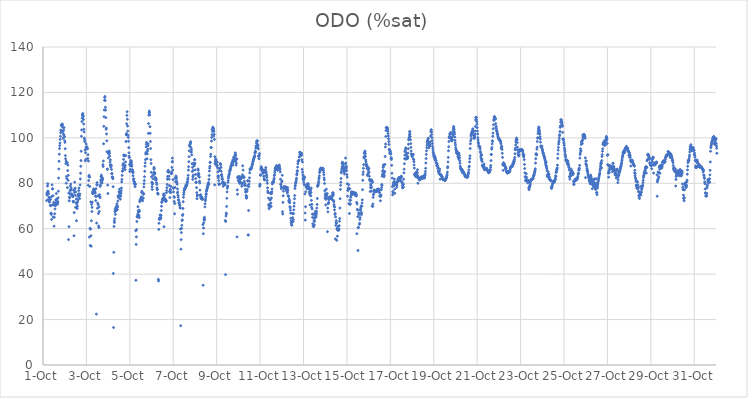
| Category | ODO (%sat) |
|---|---|
| 44470.166666666664 | 72.4 |
| 44470.177083333336 | 75.4 |
| 44470.1875 | 74.8 |
| 44470.197916666664 | 76 |
| 44470.208333333336 | 78.8 |
| 44470.21875 | 79.8 |
| 44470.229166666664 | 76.6 |
| 44470.239583333336 | 76.2 |
| 44470.25 | 72.9 |
| 44470.260416666664 | 75.4 |
| 44470.270833333336 | 73.9 |
| 44470.28125 | 72.2 |
| 44470.291666666664 | 71.7 |
| 44470.302083333336 | 72 |
| 44470.3125 | 73.8 |
| 44470.322916666664 | 72.9 |
| 44470.333333333336 | 70.3 |
| 44470.34375 | 72.9 |
| 44470.354166666664 | 70.1 |
| 44470.364583333336 | 66.8 |
| 44470.375 | 66.8 |
| 44470.385416666664 | 66.3 |
| 44470.395833333336 | 64.1 |
| 44470.40625 | 74.2 |
| 44470.416666666664 | 79.3 |
| 44470.427083333336 | 70.5 |
| 44470.4375 | 77.6 |
| 44470.447916666664 | 77.5 |
| 44470.458333333336 | 74.5 |
| 44470.46875 | 65.2 |
| 44470.479166666664 | 70.5 |
| 44470.489583333336 | 71.6 |
| 44470.5 | 70.7 |
| 44470.510416666664 | 61.1 |
| 44470.520833333336 | 65 |
| 44470.53125 | 70.6 |
| 44470.541666666664 | 66.6 |
| 44470.552083333336 | 68.7 |
| 44470.5625 | 70.4 |
| 44470.572916666664 | 70.1 |
| 44470.583333333336 | 71.2 |
| 44470.59375 | 72.7 |
| 44470.604166666664 | 72.4 |
| 44470.614583333336 | 75.5 |
| 44470.625 | 72.9 |
| 44470.635416666664 | 73 |
| 44470.645833333336 | 71.2 |
| 44470.65625 | 70.8 |
| 44470.666666666664 | 71.3 |
| 44470.677083333336 | 71 |
| 44470.6875 | 71.9 |
| 44470.697916666664 | 73.6 |
| 44470.708333333336 | 76.5 |
| 44470.71875 | 82.3 |
| 44470.729166666664 | 86.3 |
| 44470.739583333336 | 89.7 |
| 44470.75 | 92.8 |
| 44470.760416666664 | 95.3 |
| 44470.770833333336 | 96.6 |
| 44470.78125 | 97.7 |
| 44470.791666666664 | 99.3 |
| 44470.802083333336 | 100.7 |
| 44470.8125 | 102.3 |
| 44470.822916666664 | 103.4 |
| 44470.833333333336 | 103.3 |
| 44470.84375 | 105.4 |
| 44470.854166666664 | 105.5 |
| 44470.864583333336 | 105.8 |
| 44470.875 | 106 |
| 44470.885416666664 | 106.1 |
| 44470.895833333336 | 105.7 |
| 44470.90625 | 104.7 |
| 44470.916666666664 | 102.8 |
| 44470.927083333336 | 99.8 |
| 44470.9375 | 101.7 |
| 44470.947916666664 | 103.4 |
| 44470.958333333336 | 101.3 |
| 44470.96875 | 104.5 |
| 44470.979166666664 | 100.7 |
| 44470.989583333336 | 100.5 |
| 44471.0 | 98.7 |
| 44471.010416666664 | 98 |
| 44471.020833333336 | 95.2 |
| 44471.03125 | 92.2 |
| 44471.041666666664 | 90.8 |
| 44471.052083333336 | 88.7 |
| 44471.0625 | 89.8 |
| 44471.072916666664 | 80 |
| 44471.083333333336 | 83 |
| 44471.09375 | 82.1 |
| 44471.104166666664 | 89.1 |
| 44471.114583333336 | 89 |
| 44471.125 | 78.1 |
| 44471.135416666664 | 85.6 |
| 44471.145833333336 | 88 |
| 44471.15625 | 81.3 |
| 44471.166666666664 | 83.5 |
| 44471.177083333336 | 55.2 |
| 44471.1875 | 75.7 |
| 44471.197916666664 | 60.9 |
| 44471.208333333336 | 72.3 |
| 44471.21875 | 73.9 |
| 44471.229166666664 | 73.6 |
| 44471.239583333336 | 75.4 |
| 44471.25 | 76.7 |
| 44471.260416666664 | 78.8 |
| 44471.270833333336 | 77.3 |
| 44471.28125 | 79.7 |
| 44471.291666666664 | 77.1 |
| 44471.302083333336 | 77.9 |
| 44471.3125 | 75.3 |
| 44471.322916666664 | 74.7 |
| 44471.333333333336 | 75.2 |
| 44471.34375 | 74.5 |
| 44471.354166666664 | 74.9 |
| 44471.364583333336 | 74.3 |
| 44471.375 | 74.1 |
| 44471.385416666664 | 72 |
| 44471.395833333336 | 71.8 |
| 44471.40625 | 76.9 |
| 44471.416666666664 | 72 |
| 44471.427083333336 | 56.9 |
| 44471.4375 | 67.1 |
| 44471.447916666664 | 76 |
| 44471.458333333336 | 80.5 |
| 44471.46875 | 77.4 |
| 44471.479166666664 | 77.9 |
| 44471.489583333336 | 74.7 |
| 44471.5 | 69.4 |
| 44471.510416666664 | 76.2 |
| 44471.520833333336 | 71.3 |
| 44471.53125 | 73.1 |
| 44471.541666666664 | 63.5 |
| 44471.552083333336 | 69.4 |
| 44471.5625 | 70.9 |
| 44471.572916666664 | 68.9 |
| 44471.583333333336 | 69.9 |
| 44471.59375 | 71.8 |
| 44471.604166666664 | 72.7 |
| 44471.614583333336 | 74.2 |
| 44471.625 | 74.9 |
| 44471.635416666664 | 75.3 |
| 44471.645833333336 | 76.8 |
| 44471.65625 | 77.9 |
| 44471.666666666664 | 75.3 |
| 44471.677083333336 | 74.3 |
| 44471.6875 | 73.2 |
| 44471.697916666664 | 75.2 |
| 44471.708333333336 | 79.3 |
| 44471.71875 | 81.9 |
| 44471.729166666664 | 84.4 |
| 44471.739583333336 | 87.5 |
| 44471.75 | 90 |
| 44471.760416666664 | 94.1 |
| 44471.770833333336 | 100.7 |
| 44471.78125 | 103.5 |
| 44471.791666666664 | 107.2 |
| 44471.802083333336 | 108.7 |
| 44471.8125 | 110.1 |
| 44471.822916666664 | 110.1 |
| 44471.833333333336 | 110.7 |
| 44471.84375 | 109.7 |
| 44471.854166666664 | 109.4 |
| 44471.864583333336 | 108.1 |
| 44471.875 | 106.1 |
| 44471.885416666664 | 103.8 |
| 44471.895833333336 | 102.6 |
| 44471.90625 | 99.9 |
| 44471.916666666664 | 99.1 |
| 44471.927083333336 | 98.3 |
| 44471.9375 | 94.7 |
| 44471.947916666664 | 89.9 |
| 44471.958333333336 | 93.5 |
| 44471.96875 | 90.5 |
| 44471.979166666664 | 95.9 |
| 44471.989583333336 | 97.3 |
| 44472.0 | 95.4 |
| 44472.010416666664 | 95.6 |
| 44472.020833333336 | 96.1 |
| 44472.03125 | 95.4 |
| 44472.041666666664 | 95.3 |
| 44472.052083333336 | 95.2 |
| 44472.0625 | 90.9 |
| 44472.072916666664 | 92.6 |
| 44472.083333333336 | 79.1 |
| 44472.09375 | 89.8 |
| 44472.104166666664 | 81.2 |
| 44472.114583333336 | 83 |
| 44472.125 | 83.5 |
| 44472.135416666664 | 56.3 |
| 44472.145833333336 | 82.7 |
| 44472.15625 | 78.6 |
| 44472.166666666664 | 60.2 |
| 44472.177083333336 | 52.6 |
| 44472.1875 | 59.8 |
| 44472.197916666664 | 71.8 |
| 44472.208333333336 | 56.9 |
| 44472.21875 | 52.3 |
| 44472.229166666664 | 63.5 |
| 44472.239583333336 | 70.7 |
| 44472.25 | 67.6 |
| 44472.260416666664 | 69.4 |
| 44472.270833333336 | 71.7 |
| 44472.28125 | 76.1 |
| 44472.291666666664 | 75.5 |
| 44472.302083333336 | 75.4 |
| 44472.3125 | 76.4 |
| 44472.322916666664 | 77.3 |
| 44472.333333333336 | 77.5 |
| 44472.34375 | 76.6 |
| 44472.354166666664 | 76.8 |
| 44472.364583333336 | 76.8 |
| 44472.375 | 77.1 |
| 44472.385416666664 | 76.3 |
| 44472.395833333336 | 75.8 |
| 44472.40625 | 75.7 |
| 44472.416666666664 | 74.3 |
| 44472.427083333336 | 72.4 |
| 44472.4375 | 77.6 |
| 44472.447916666664 | 74.2 |
| 44472.458333333336 | 22.4 |
| 44472.46875 | 62.5 |
| 44472.479166666664 | 79.3 |
| 44472.489583333336 | 80.3 |
| 44472.5 | 79.3 |
| 44472.510416666664 | 69 |
| 44472.520833333336 | 71.3 |
| 44472.53125 | 74.5 |
| 44472.541666666664 | 70.6 |
| 44472.552083333336 | 66.7 |
| 44472.5625 | 61.2 |
| 44472.572916666664 | 60.5 |
| 44472.583333333336 | 69.6 |
| 44472.59375 | 67.6 |
| 44472.604166666664 | 75 |
| 44472.614583333336 | 74.1 |
| 44472.625 | 73.7 |
| 44472.635416666664 | 78.6 |
| 44472.645833333336 | 79.2 |
| 44472.65625 | 81.4 |
| 44472.666666666664 | 80.4 |
| 44472.677083333336 | 83 |
| 44472.6875 | 83.6 |
| 44472.697916666664 | 82.8 |
| 44472.708333333336 | 81.8 |
| 44472.71875 | 80.1 |
| 44472.729166666664 | 81.2 |
| 44472.739583333336 | 82.3 |
| 44472.75 | 81.9 |
| 44472.760416666664 | 88.2 |
| 44472.770833333336 | 87.4 |
| 44472.78125 | 89.8 |
| 44472.791666666664 | 97.4 |
| 44472.802083333336 | 105.1 |
| 44472.8125 | 109.3 |
| 44472.822916666664 | 112.3 |
| 44472.833333333336 | 116.5 |
| 44472.84375 | 117.8 |
| 44472.854166666664 | 118.2 |
| 44472.864583333336 | 116.5 |
| 44472.875 | 113.5 |
| 44472.885416666664 | 112.2 |
| 44472.895833333336 | 108.9 |
| 44472.90625 | 103.8 |
| 44472.916666666664 | 104.3 |
| 44472.927083333336 | 101.7 |
| 44472.9375 | 98.7 |
| 44472.947916666664 | 93.9 |
| 44472.958333333336 | 86.2 |
| 44472.96875 | 86.2 |
| 44472.979166666664 | 79.2 |
| 44472.989583333336 | 75.5 |
| 44473.0 | 93.3 |
| 44473.010416666664 | 91.2 |
| 44473.020833333336 | 93.1 |
| 44473.03125 | 93.3 |
| 44473.041666666664 | 93.7 |
| 44473.052083333336 | 94.2 |
| 44473.0625 | 93.2 |
| 44473.072916666664 | 92 |
| 44473.083333333336 | 89.3 |
| 44473.09375 | 88.1 |
| 44473.104166666664 | 90.3 |
| 44473.114583333336 | 87.7 |
| 44473.125 | 87.1 |
| 44473.135416666664 | 88.1 |
| 44473.145833333336 | 87.7 |
| 44473.15625 | 86.1 |
| 44473.166666666664 | 84.2 |
| 44473.177083333336 | 84.3 |
| 44473.1875 | 82.6 |
| 44473.197916666664 | 82.8 |
| 44473.208333333336 | 82.6 |
| 44473.21875 | 82 |
| 44473.229166666664 | 78.5 |
| 44473.239583333336 | 40.3 |
| 44473.25 | 16.5 |
| 44473.260416666664 | 49.6 |
| 44473.270833333336 | 61 |
| 44473.28125 | 63.4 |
| 44473.291666666664 | 62.7 |
| 44473.302083333336 | 64.4 |
| 44473.3125 | 67.5 |
| 44473.322916666664 | 68.5 |
| 44473.333333333336 | 66.3 |
| 44473.34375 | 67.8 |
| 44473.354166666664 | 69 |
| 44473.364583333336 | 69.3 |
| 44473.375 | 69.6 |
| 44473.385416666664 | 69.9 |
| 44473.395833333336 | 68.2 |
| 44473.40625 | 71 |
| 44473.416666666664 | 69.3 |
| 44473.427083333336 | 68.4 |
| 44473.4375 | 69.9 |
| 44473.447916666664 | 72.2 |
| 44473.458333333336 | 74.5 |
| 44473.46875 | 73.8 |
| 44473.479166666664 | 74.3 |
| 44473.489583333336 | 73.8 |
| 44473.5 | 76.2 |
| 44473.510416666664 | 76.2 |
| 44473.520833333336 | 77.4 |
| 44473.53125 | 76.2 |
| 44473.541666666664 | 75.5 |
| 44473.552083333336 | 75.3 |
| 44473.5625 | 73 |
| 44473.572916666664 | 74.4 |
| 44473.583333333336 | 74.4 |
| 44473.59375 | 75.7 |
| 44473.604166666664 | 76.7 |
| 44473.614583333336 | 77.9 |
| 44473.625 | 80.6 |
| 44473.635416666664 | 81.7 |
| 44473.645833333336 | 83.5 |
| 44473.65625 | 85.3 |
| 44473.666666666664 | 85.4 |
| 44473.677083333336 | 87.9 |
| 44473.6875 | 86.5 |
| 44473.697916666664 | 88.7 |
| 44473.708333333336 | 90.5 |
| 44473.71875 | 92.3 |
| 44473.729166666664 | 92.5 |
| 44473.739583333336 | 92 |
| 44473.75 | 87.6 |
| 44473.760416666664 | 87.9 |
| 44473.770833333336 | 87 |
| 44473.78125 | 86 |
| 44473.791666666664 | 87.8 |
| 44473.802083333336 | 89.4 |
| 44473.8125 | 92.2 |
| 44473.822916666664 | 98.4 |
| 44473.833333333336 | 101.3 |
| 44473.84375 | 101.9 |
| 44473.854166666664 | 106.2 |
| 44473.864583333336 | 109.9 |
| 44473.875 | 111.5 |
| 44473.885416666664 | 108.2 |
| 44473.895833333336 | 105.2 |
| 44473.90625 | 103 |
| 44473.916666666664 | 101.2 |
| 44473.927083333336 | 100.2 |
| 44473.9375 | 98.5 |
| 44473.947916666664 | 95.7 |
| 44473.958333333336 | 93.4 |
| 44473.96875 | 91.9 |
| 44473.979166666664 | 91.3 |
| 44473.989583333336 | 88.3 |
| 44474.0 | 85.2 |
| 44474.010416666664 | 86.1 |
| 44474.020833333336 | 87.7 |
| 44474.03125 | 89.2 |
| 44474.041666666664 | 90 |
| 44474.052083333336 | 89.7 |
| 44474.0625 | 89.8 |
| 44474.072916666664 | 89.2 |
| 44474.083333333336 | 88.3 |
| 44474.09375 | 87.5 |
| 44474.104166666664 | 86 |
| 44474.114583333336 | 85.3 |
| 44474.125 | 85.8 |
| 44474.135416666664 | 84.6 |
| 44474.145833333336 | 83.3 |
| 44474.15625 | 84.9 |
| 44474.166666666664 | 81.9 |
| 44474.177083333336 | 81 |
| 44474.1875 | 81.9 |
| 44474.197916666664 | 80.6 |
| 44474.208333333336 | 79.8 |
| 44474.21875 | 80.5 |
| 44474.229166666664 | 79.6 |
| 44474.239583333336 | 78.5 |
| 44474.25 | 79.7 |
| 44474.260416666664 | 79.5 |
| 44474.270833333336 | 59.1 |
| 44474.28125 | 37.3 |
| 44474.291666666664 | 53.1 |
| 44474.302083333336 | 56.4 |
| 44474.3125 | 59.6 |
| 44474.322916666664 | 63.2 |
| 44474.333333333336 | 65.3 |
| 44474.34375 | 65.1 |
| 44474.354166666664 | 65.6 |
| 44474.364583333336 | 66.4 |
| 44474.375 | 69.7 |
| 44474.385416666664 | 67.9 |
| 44474.395833333336 | 67.3 |
| 44474.40625 | 65.5 |
| 44474.416666666664 | 65.9 |
| 44474.427083333336 | 68.2 |
| 44474.4375 | 64.9 |
| 44474.447916666664 | 67.7 |
| 44474.458333333336 | 71.9 |
| 44474.46875 | 72.5 |
| 44474.479166666664 | 72.7 |
| 44474.489583333336 | 72.8 |
| 44474.5 | 72.8 |
| 44474.510416666664 | 73.5 |
| 44474.520833333336 | 73.5 |
| 44474.53125 | 74 |
| 44474.541666666664 | 76 |
| 44474.552083333336 | 73 |
| 44474.5625 | 76.5 |
| 44474.572916666664 | 73.4 |
| 44474.583333333336 | 72.3 |
| 44474.59375 | 73.5 |
| 44474.604166666664 | 73.4 |
| 44474.614583333336 | 73.5 |
| 44474.625 | 75.1 |
| 44474.635416666664 | 75.5 |
| 44474.645833333336 | 78.4 |
| 44474.65625 | 79.8 |
| 44474.666666666664 | 81.2 |
| 44474.677083333336 | 82.9 |
| 44474.6875 | 85.3 |
| 44474.697916666664 | 87.5 |
| 44474.708333333336 | 89 |
| 44474.71875 | 90.4 |
| 44474.729166666664 | 92.9 |
| 44474.739583333336 | 93.6 |
| 44474.75 | 96 |
| 44474.760416666664 | 97.2 |
| 44474.770833333336 | 98 |
| 44474.78125 | 93.1 |
| 44474.791666666664 | 90.8 |
| 44474.802083333336 | 93 |
| 44474.8125 | 94.2 |
| 44474.822916666664 | 95 |
| 44474.833333333336 | 96.5 |
| 44474.84375 | 97.3 |
| 44474.854166666664 | 102 |
| 44474.864583333336 | 106.3 |
| 44474.875 | 110 |
| 44474.885416666664 | 111 |
| 44474.895833333336 | 111.8 |
| 44474.90625 | 111.2 |
| 44474.916666666664 | 110.1 |
| 44474.927083333336 | 104.9 |
| 44474.9375 | 102 |
| 44474.947916666664 | 98.4 |
| 44474.958333333336 | 95.3 |
| 44474.96875 | 90.4 |
| 44474.979166666664 | 88.7 |
| 44474.989583333336 | 84.8 |
| 44475.0 | 82.9 |
| 44475.010416666664 | 80.4 |
| 44475.020833333336 | 78.5 |
| 44475.03125 | 77.3 |
| 44475.041666666664 | 79.6 |
| 44475.052083333336 | 80.2 |
| 44475.0625 | 82 |
| 44475.072916666664 | 83.5 |
| 44475.083333333336 | 83.8 |
| 44475.09375 | 84.7 |
| 44475.104166666664 | 86.3 |
| 44475.114583333336 | 87 |
| 44475.125 | 86.3 |
| 44475.135416666664 | 84.8 |
| 44475.145833333336 | 84.5 |
| 44475.15625 | 84.2 |
| 44475.166666666664 | 82.6 |
| 44475.177083333336 | 82 |
| 44475.1875 | 81.4 |
| 44475.197916666664 | 82.3 |
| 44475.208333333336 | 82 |
| 44475.21875 | 81.4 |
| 44475.229166666664 | 80.2 |
| 44475.239583333336 | 79.5 |
| 44475.25 | 78 |
| 44475.260416666664 | 77.2 |
| 44475.270833333336 | 77.3 |
| 44475.28125 | 75.7 |
| 44475.291666666664 | 75.4 |
| 44475.302083333336 | 75.2 |
| 44475.3125 | 37.7 |
| 44475.322916666664 | 37 |
| 44475.333333333336 | 59.7 |
| 44475.34375 | 62.4 |
| 44475.354166666664 | 64.1 |
| 44475.364583333336 | 64.6 |
| 44475.375 | 64.5 |
| 44475.385416666664 | 64.8 |
| 44475.395833333336 | 66.1 |
| 44475.40625 | 65.9 |
| 44475.416666666664 | 64.3 |
| 44475.427083333336 | 64.9 |
| 44475.4375 | 65.9 |
| 44475.447916666664 | 68 |
| 44475.458333333336 | 69.9 |
| 44475.46875 | 71.6 |
| 44475.479166666664 | 71.7 |
| 44475.489583333336 | 72.2 |
| 44475.5 | 73 |
| 44475.510416666664 | 72.7 |
| 44475.520833333336 | 73 |
| 44475.53125 | 73.1 |
| 44475.541666666664 | 73.6 |
| 44475.552083333336 | 75.2 |
| 44475.5625 | 74.6 |
| 44475.572916666664 | 60.9 |
| 44475.583333333336 | 75.3 |
| 44475.59375 | 74.6 |
| 44475.604166666664 | 73 |
| 44475.614583333336 | 73.3 |
| 44475.625 | 72.7 |
| 44475.635416666664 | 72.3 |
| 44475.645833333336 | 72.5 |
| 44475.65625 | 72.2 |
| 44475.666666666664 | 72 |
| 44475.677083333336 | 72.5 |
| 44475.6875 | 75.9 |
| 44475.697916666664 | 76.8 |
| 44475.708333333336 | 78.1 |
| 44475.71875 | 79.5 |
| 44475.729166666664 | 81.8 |
| 44475.739583333336 | 83 |
| 44475.75 | 85.2 |
| 44475.760416666664 | 85 |
| 44475.770833333336 | 85.7 |
| 44475.78125 | 84.9 |
| 44475.791666666664 | 85.1 |
| 44475.802083333336 | 83.1 |
| 44475.8125 | 81.8 |
| 44475.822916666664 | 79 |
| 44475.833333333336 | 76.4 |
| 44475.84375 | 73.7 |
| 44475.854166666664 | 76 |
| 44475.864583333336 | 77.3 |
| 44475.875 | 77.1 |
| 44475.885416666664 | 75.9 |
| 44475.895833333336 | 78.6 |
| 44475.90625 | 84.2 |
| 44475.916666666664 | 84.9 |
| 44475.927083333336 | 84.4 |
| 44475.9375 | 87 |
| 44475.947916666664 | 89.4 |
| 44475.958333333336 | 91.1 |
| 44475.96875 | 89.6 |
| 44475.979166666664 | 85.8 |
| 44475.989583333336 | 81.6 |
| 44476.0 | 77.9 |
| 44476.010416666664 | 76.2 |
| 44476.020833333336 | 77.8 |
| 44476.03125 | 74.1 |
| 44476.041666666664 | 72 |
| 44476.052083333336 | 73.8 |
| 44476.0625 | 66.6 |
| 44476.072916666664 | 71.1 |
| 44476.083333333336 | 78.2 |
| 44476.09375 | 82.2 |
| 44476.104166666664 | 80.7 |
| 44476.114583333336 | 82.6 |
| 44476.125 | 83.2 |
| 44476.135416666664 | 82.8 |
| 44476.145833333336 | 82.1 |
| 44476.15625 | 80.9 |
| 44476.166666666664 | 80.2 |
| 44476.177083333336 | 79.6 |
| 44476.1875 | 75.8 |
| 44476.197916666664 | 77.5 |
| 44476.208333333336 | 76.1 |
| 44476.21875 | 74.7 |
| 44476.229166666664 | 73.9 |
| 44476.239583333336 | 72.8 |
| 44476.25 | 72.5 |
| 44476.260416666664 | 71.4 |
| 44476.270833333336 | 71.4 |
| 44476.28125 | 71.4 |
| 44476.291666666664 | 70.6 |
| 44476.302083333336 | 70.2 |
| 44476.3125 | 69.2 |
| 44476.322916666664 | 69.1 |
| 44476.333333333336 | 59.9 |
| 44476.34375 | 17.3 |
| 44476.354166666664 | 51 |
| 44476.364583333336 | 55.2 |
| 44476.375 | 58.3 |
| 44476.385416666664 | 60.1 |
| 44476.395833333336 | 61.5 |
| 44476.40625 | 63.6 |
| 44476.416666666664 | 63.9 |
| 44476.427083333336 | 65.8 |
| 44476.4375 | 66.3 |
| 44476.447916666664 | 68.9 |
| 44476.458333333336 | 71.9 |
| 44476.46875 | 73.8 |
| 44476.479166666664 | 75 |
| 44476.489583333336 | 75.9 |
| 44476.5 | 76.8 |
| 44476.510416666664 | 76.9 |
| 44476.520833333336 | 77.7 |
| 44476.53125 | 77.8 |
| 44476.541666666664 | 77.7 |
| 44476.552083333336 | 78 |
| 44476.5625 | 78.1 |
| 44476.572916666664 | 78.7 |
| 44476.583333333336 | 79 |
| 44476.59375 | 79.3 |
| 44476.604166666664 | 79.2 |
| 44476.614583333336 | 79.3 |
| 44476.625 | 78.9 |
| 44476.635416666664 | 79.7 |
| 44476.645833333336 | 80.3 |
| 44476.65625 | 80.8 |
| 44476.666666666664 | 81.7 |
| 44476.677083333336 | 82.3 |
| 44476.6875 | 83.5 |
| 44476.697916666664 | 85.8 |
| 44476.708333333336 | 87.3 |
| 44476.71875 | 89.5 |
| 44476.729166666664 | 91.7 |
| 44476.739583333336 | 94.3 |
| 44476.75 | 96.6 |
| 44476.760416666664 | 96.3 |
| 44476.770833333336 | 97.1 |
| 44476.78125 | 97.8 |
| 44476.791666666664 | 97.5 |
| 44476.802083333336 | 98.3 |
| 44476.8125 | 95.8 |
| 44476.822916666664 | 93.7 |
| 44476.833333333336 | 93.8 |
| 44476.84375 | 94.9 |
| 44476.854166666664 | 92.5 |
| 44476.864583333336 | 88.6 |
| 44476.875 | 85.2 |
| 44476.885416666664 | 87 |
| 44476.895833333336 | 81.7 |
| 44476.90625 | 82.9 |
| 44476.916666666664 | 83.6 |
| 44476.927083333336 | 85.7 |
| 44476.9375 | 88.9 |
| 44476.947916666664 | 88.3 |
| 44476.958333333336 | 87.7 |
| 44476.96875 | 88.2 |
| 44476.979166666664 | 90.4 |
| 44476.989583333336 | 90.4 |
| 44477.0 | 88.8 |
| 44477.010416666664 | 85.9 |
| 44477.020833333336 | 83.9 |
| 44477.03125 | 82.1 |
| 44477.041666666664 | 80.5 |
| 44477.052083333336 | 80.4 |
| 44477.0625 | 80.4 |
| 44477.072916666664 | 78.1 |
| 44477.083333333336 | 75.9 |
| 44477.09375 | 73.2 |
| 44477.104166666664 | 74.4 |
| 44477.114583333336 | 74.9 |
| 44477.125 | 84 |
| 44477.135416666664 | 86.3 |
| 44477.145833333336 | 83.4 |
| 44477.15625 | 85.8 |
| 44477.166666666664 | 84.4 |
| 44477.177083333336 | 83.9 |
| 44477.1875 | 82.9 |
| 44477.197916666664 | 82.7 |
| 44477.208333333336 | 80.9 |
| 44477.21875 | 80.1 |
| 44477.229166666664 | 77 |
| 44477.239583333336 | 74.8 |
| 44477.25 | 74.8 |
| 44477.260416666664 | 73.7 |
| 44477.270833333336 | 74.9 |
| 44477.28125 | 74.2 |
| 44477.291666666664 | 73.1 |
| 44477.302083333336 | 73.8 |
| 44477.3125 | 73.9 |
| 44477.322916666664 | 73.8 |
| 44477.333333333336 | 73.1 |
| 44477.34375 | 73.1 |
| 44477.354166666664 | 72.9 |
| 44477.364583333336 | 61.8 |
| 44477.375 | 35.1 |
| 44477.385416666664 | 57.8 |
| 44477.395833333336 | 60.3 |
| 44477.40625 | 62.6 |
| 44477.416666666664 | 63.9 |
| 44477.427083333336 | 64.4 |
| 44477.4375 | 65 |
| 44477.447916666664 | 63.9 |
| 44477.458333333336 | 69.6 |
| 44477.46875 | 71 |
| 44477.479166666664 | 72.3 |
| 44477.489583333336 | 73.1 |
| 44477.5 | 74.1 |
| 44477.510416666664 | 75 |
| 44477.520833333336 | 75.5 |
| 44477.53125 | 76.5 |
| 44477.541666666664 | 77 |
| 44477.552083333336 | 77.3 |
| 44477.5625 | 77.8 |
| 44477.572916666664 | 78.3 |
| 44477.583333333336 | 78.5 |
| 44477.59375 | 79.1 |
| 44477.604166666664 | 79.5 |
| 44477.614583333336 | 80 |
| 44477.625 | 80.3 |
| 44477.635416666664 | 79.5 |
| 44477.645833333336 | 81.7 |
| 44477.65625 | 83.4 |
| 44477.666666666664 | 85.4 |
| 44477.677083333336 | 86.7 |
| 44477.6875 | 87.5 |
| 44477.697916666664 | 89.3 |
| 44477.708333333336 | 89.1 |
| 44477.71875 | 91.8 |
| 44477.729166666664 | 92.8 |
| 44477.739583333336 | 95.8 |
| 44477.75 | 95.7 |
| 44477.760416666664 | 98.6 |
| 44477.770833333336 | 100.2 |
| 44477.78125 | 101.4 |
| 44477.791666666664 | 103.7 |
| 44477.802083333336 | 102.8 |
| 44477.8125 | 103.8 |
| 44477.822916666664 | 104.7 |
| 44477.833333333336 | 104.4 |
| 44477.84375 | 103.5 |
| 44477.854166666664 | 104 |
| 44477.864583333336 | 100.8 |
| 44477.875 | 102.9 |
| 44477.885416666664 | 101.6 |
| 44477.895833333336 | 99.3 |
| 44477.90625 | 79.3 |
| 44477.916666666664 | 91.7 |
| 44477.927083333336 | 88.6 |
| 44477.9375 | 89.5 |
| 44477.947916666664 | 90.3 |
| 44477.958333333336 | 90.7 |
| 44477.96875 | 90.3 |
| 44477.979166666664 | 88.4 |
| 44477.989583333336 | 87.9 |
| 44478.0 | 87.7 |
| 44478.010416666664 | 89.2 |
| 44478.020833333336 | 89.4 |
| 44478.03125 | 87.8 |
| 44478.041666666664 | 86.8 |
| 44478.052083333336 | 85 |
| 44478.0625 | 83.2 |
| 44478.072916666664 | 82.4 |
| 44478.083333333336 | 83.2 |
| 44478.09375 | 81.2 |
| 44478.104166666664 | 79.8 |
| 44478.114583333336 | 79.4 |
| 44478.125 | 85.6 |
| 44478.135416666664 | 86.4 |
| 44478.145833333336 | 79.7 |
| 44478.15625 | 86.7 |
| 44478.166666666664 | 88.7 |
| 44478.177083333336 | 88.4 |
| 44478.1875 | 88.2 |
| 44478.197916666664 | 87 |
| 44478.208333333336 | 85.3 |
| 44478.21875 | 83.5 |
| 44478.229166666664 | 83.9 |
| 44478.239583333336 | 81.9 |
| 44478.25 | 82.8 |
| 44478.260416666664 | 80 |
| 44478.270833333336 | 81.8 |
| 44478.28125 | 80.7 |
| 44478.291666666664 | 80 |
| 44478.302083333336 | 78.7 |
| 44478.3125 | 80.3 |
| 44478.322916666664 | 79.9 |
| 44478.333333333336 | 79.8 |
| 44478.34375 | 79.5 |
| 44478.354166666664 | 79.5 |
| 44478.364583333336 | 79.5 |
| 44478.375 | 80.1 |
| 44478.385416666664 | 79.4 |
| 44478.395833333336 | 63.6 |
| 44478.40625 | 39.8 |
| 44478.416666666664 | 63.2 |
| 44478.427083333336 | 65.6 |
| 44478.4375 | 66.9 |
| 44478.447916666664 | 66.5 |
| 44478.458333333336 | 69.8 |
| 44478.46875 | 73.4 |
| 44478.479166666664 | 76.2 |
| 44478.489583333336 | 77.8 |
| 44478.5 | 78.5 |
| 44478.510416666664 | 78.8 |
| 44478.520833333336 | 80.4 |
| 44478.53125 | 81.2 |
| 44478.541666666664 | 82.3 |
| 44478.552083333336 | 82.9 |
| 44478.5625 | 83.5 |
| 44478.572916666664 | 84 |
| 44478.583333333336 | 84.3 |
| 44478.59375 | 85.5 |
| 44478.604166666664 | 85.2 |
| 44478.614583333336 | 85.6 |
| 44478.625 | 86.1 |
| 44478.635416666664 | 86.4 |
| 44478.645833333336 | 87.1 |
| 44478.65625 | 87.3 |
| 44478.666666666664 | 87.7 |
| 44478.677083333336 | 87.9 |
| 44478.6875 | 88.2 |
| 44478.697916666664 | 88.9 |
| 44478.708333333336 | 89.2 |
| 44478.71875 | 89 |
| 44478.729166666664 | 88.9 |
| 44478.739583333336 | 90.2 |
| 44478.75 | 88 |
| 44478.760416666664 | 90.2 |
| 44478.770833333336 | 90.3 |
| 44478.78125 | 91.5 |
| 44478.791666666664 | 89.6 |
| 44478.802083333336 | 91 |
| 44478.8125 | 90.6 |
| 44478.822916666664 | 91.5 |
| 44478.833333333336 | 90.2 |
| 44478.84375 | 92.5 |
| 44478.854166666664 | 93.4 |
| 44478.864583333336 | 92.9 |
| 44478.875 | 92.2 |
| 44478.885416666664 | 89.7 |
| 44478.895833333336 | 88 |
| 44478.90625 | 88.8 |
| 44478.916666666664 | 90.6 |
| 44478.927083333336 | 90.8 |
| 44478.9375 | 56.4 |
| 44478.947916666664 | 77.1 |
| 44478.958333333336 | 75.2 |
| 44478.96875 | 82.6 |
| 44478.979166666664 | 82.2 |
| 44478.989583333336 | 82.9 |
| 44479.0 | 81.1 |
| 44479.010416666664 | 82.9 |
| 44479.020833333336 | 81.4 |
| 44479.03125 | 80.9 |
| 44479.041666666664 | 82.9 |
| 44479.052083333336 | 80.4 |
| 44479.0625 | 79.9 |
| 44479.072916666664 | 81.6 |
| 44479.083333333336 | 81.6 |
| 44479.09375 | 82.2 |
| 44479.104166666664 | 80.3 |
| 44479.114583333336 | 82.8 |
| 44479.125 | 82.2 |
| 44479.135416666664 | 82.1 |
| 44479.145833333336 | 80 |
| 44479.15625 | 78.7 |
| 44479.166666666664 | 79.9 |
| 44479.177083333336 | 80.1 |
| 44479.1875 | 83.7 |
| 44479.197916666664 | 87.7 |
| 44479.208333333336 | 82.8 |
| 44479.21875 | 85.8 |
| 44479.229166666664 | 82.9 |
| 44479.239583333336 | 83 |
| 44479.25 | 82.8 |
| 44479.260416666664 | 82.5 |
| 44479.270833333336 | 80.9 |
| 44479.28125 | 79.2 |
| 44479.291666666664 | 80 |
| 44479.302083333336 | 79.3 |
| 44479.3125 | 79.1 |
| 44479.322916666664 | 77.3 |
| 44479.333333333336 | 76.2 |
| 44479.34375 | 76.2 |
| 44479.354166666664 | 74.6 |
| 44479.364583333336 | 73.8 |
| 44479.375 | 73.4 |
| 44479.385416666664 | 74.2 |
| 44479.395833333336 | 76.4 |
| 44479.40625 | 77.3 |
| 44479.416666666664 | 78.9 |
| 44479.427083333336 | 81.1 |
| 44479.4375 | 81.1 |
| 44479.447916666664 | 57.3 |
| 44479.458333333336 | 57.2 |
| 44479.46875 | 68 |
| 44479.479166666664 | 78.5 |
| 44479.489583333336 | 79.6 |
| 44479.5 | 80.9 |
| 44479.510416666664 | 82.4 |
| 44479.520833333336 | 84.6 |
| 44479.53125 | 85.9 |
| 44479.541666666664 | 86.4 |
| 44479.552083333336 | 86.4 |
| 44479.5625 | 86.2 |
| 44479.572916666664 | 86.4 |
| 44479.583333333336 | 86.3 |
| 44479.59375 | 86.5 |
| 44479.604166666664 | 86.8 |
| 44479.614583333336 | 87.2 |
| 44479.625 | 87.6 |
| 44479.635416666664 | 88.1 |
| 44479.645833333336 | 88.4 |
| 44479.65625 | 88.8 |
| 44479.666666666664 | 89.5 |
| 44479.677083333336 | 89.7 |
| 44479.6875 | 90.3 |
| 44479.697916666664 | 90.4 |
| 44479.708333333336 | 90.8 |
| 44479.71875 | 91.4 |
| 44479.729166666664 | 91.6 |
| 44479.739583333336 | 91.6 |
| 44479.75 | 92.2 |
| 44479.760416666664 | 93.5 |
| 44479.770833333336 | 93.3 |
| 44479.78125 | 94.1 |
| 44479.791666666664 | 93.9 |
| 44479.802083333336 | 95.4 |
| 44479.8125 | 96.1 |
| 44479.822916666664 | 96.5 |
| 44479.833333333336 | 97.6 |
| 44479.84375 | 98.4 |
| 44479.854166666664 | 98.7 |
| 44479.864583333336 | 98.4 |
| 44479.875 | 98.7 |
| 44479.885416666664 | 97.1 |
| 44479.895833333336 | 95.5 |
| 44479.90625 | 96.5 |
| 44479.916666666664 | 95.2 |
| 44479.927083333336 | 92 |
| 44479.9375 | 91.8 |
| 44479.947916666664 | 90.8 |
| 44479.958333333336 | 92.3 |
| 44479.96875 | 93.1 |
| 44479.979166666664 | 78.7 |
| 44479.989583333336 | 79.6 |
| 44480.0 | 79.3 |
| 44480.010416666664 | 83.6 |
| 44480.020833333336 | 83.6 |
| 44480.03125 | 86.2 |
| 44480.041666666664 | 86.7 |
| 44480.052083333336 | 87.3 |
| 44480.0625 | 86.8 |
| 44480.072916666664 | 86.1 |
| 44480.083333333336 | 85.8 |
| 44480.09375 | 85.9 |
| 44480.104166666664 | 86.2 |
| 44480.114583333336 | 85 |
| 44480.125 | 84.4 |
| 44480.135416666664 | 85.7 |
| 44480.145833333336 | 85 |
| 44480.15625 | 84.9 |
| 44480.166666666664 | 83 |
| 44480.177083333336 | 83.2 |
| 44480.1875 | 81.8 |
| 44480.197916666664 | 81.7 |
| 44480.208333333336 | 81.5 |
| 44480.21875 | 84.9 |
| 44480.229166666664 | 85.7 |
| 44480.239583333336 | 84.8 |
| 44480.25 | 86.1 |
| 44480.260416666664 | 86.9 |
| 44480.270833333336 | 85.1 |
| 44480.28125 | 84.7 |
| 44480.291666666664 | 83.3 |
| 44480.302083333336 | 83.7 |
| 44480.3125 | 82.6 |
| 44480.322916666664 | 81.2 |
| 44480.333333333336 | 80 |
| 44480.34375 | 78 |
| 44480.354166666664 | 76.6 |
| 44480.364583333336 | 76 |
| 44480.375 | 75.9 |
| 44480.385416666664 | 73.5 |
| 44480.395833333336 | 70.6 |
| 44480.40625 | 70.1 |
| 44480.416666666664 | 68.8 |
| 44480.427083333336 | 69.5 |
| 44480.4375 | 70.2 |
| 44480.447916666664 | 70.8 |
| 44480.458333333336 | 72.6 |
| 44480.46875 | 72.9 |
| 44480.479166666664 | 75.8 |
| 44480.489583333336 | 75.4 |
| 44480.5 | 71.3 |
| 44480.510416666664 | 69.8 |
| 44480.520833333336 | 73.5 |
| 44480.53125 | 75.5 |
| 44480.541666666664 | 76.3 |
| 44480.552083333336 | 77.5 |
| 44480.5625 | 79.7 |
| 44480.572916666664 | 80.5 |
| 44480.583333333336 | 80.3 |
| 44480.59375 | 80.4 |
| 44480.604166666664 | 80.3 |
| 44480.614583333336 | 80.6 |
| 44480.625 | 81 |
| 44480.635416666664 | 81.5 |
| 44480.645833333336 | 82.2 |
| 44480.65625 | 83.4 |
| 44480.666666666664 | 83.9 |
| 44480.677083333336 | 84.9 |
| 44480.6875 | 85.7 |
| 44480.697916666664 | 86.5 |
| 44480.708333333336 | 86.5 |
| 44480.71875 | 86.9 |
| 44480.729166666664 | 87.1 |
| 44480.739583333336 | 87.2 |
| 44480.75 | 87.4 |
| 44480.760416666664 | 87.8 |
| 44480.770833333336 | 87.4 |
| 44480.78125 | 87.5 |
| 44480.791666666664 | 86.7 |
| 44480.802083333336 | 86 |
| 44480.8125 | 85.7 |
| 44480.822916666664 | 86.4 |
| 44480.833333333336 | 87.6 |
| 44480.84375 | 87.5 |
| 44480.854166666664 | 87.4 |
| 44480.864583333336 | 87.4 |
| 44480.875 | 87.7 |
| 44480.885416666664 | 88 |
| 44480.895833333336 | 87.1 |
| 44480.90625 | 86.4 |
| 44480.916666666664 | 86.1 |
| 44480.927083333336 | 85 |
| 44480.9375 | 81.8 |
| 44480.947916666664 | 79.6 |
| 44480.958333333336 | 79.5 |
| 44480.96875 | 78.7 |
| 44480.979166666664 | 77.6 |
| 44480.989583333336 | 78 |
| 44481.0 | 80.6 |
| 44481.010416666664 | 81 |
| 44481.020833333336 | 83.5 |
| 44481.03125 | 67.5 |
| 44481.041666666664 | 66.5 |
| 44481.052083333336 | 71.6 |
| 44481.0625 | 74.5 |
| 44481.072916666664 | 76.5 |
| 44481.083333333336 | 77.8 |
| 44481.09375 | 77.9 |
| 44481.104166666664 | 78.4 |
| 44481.114583333336 | 78.6 |
| 44481.125 | 78 |
| 44481.135416666664 | 77.8 |
| 44481.145833333336 | 78.2 |
| 44481.15625 | 78 |
| 44481.166666666664 | 77.8 |
| 44481.177083333336 | 78.5 |
| 44481.1875 | 77.6 |
| 44481.197916666664 | 77.6 |
| 44481.208333333336 | 77 |
| 44481.21875 | 77.1 |
| 44481.229166666664 | 76.6 |
| 44481.239583333336 | 77.7 |
| 44481.25 | 75.7 |
| 44481.260416666664 | 76.2 |
| 44481.270833333336 | 78.1 |
| 44481.28125 | 77 |
| 44481.291666666664 | 74.5 |
| 44481.302083333336 | 74.3 |
| 44481.3125 | 74.2 |
| 44481.322916666664 | 72.3 |
| 44481.333333333336 | 71.8 |
| 44481.34375 | 73 |
| 44481.354166666664 | 72.2 |
| 44481.364583333336 | 71.4 |
| 44481.375 | 69.7 |
| 44481.385416666664 | 69.2 |
| 44481.395833333336 | 68.2 |
| 44481.40625 | 66.9 |
| 44481.416666666664 | 64.6 |
| 44481.427083333336 | 63.4 |
| 44481.4375 | 62.6 |
| 44481.447916666664 | 62 |
| 44481.458333333336 | 61.5 |
| 44481.46875 | 63.1 |
| 44481.479166666664 | 63.1 |
| 44481.489583333336 | 66.6 |
| 44481.5 | 64.9 |
| 44481.510416666664 | 66.7 |
| 44481.520833333336 | 63.1 |
| 44481.53125 | 64 |
| 44481.541666666664 | 66.7 |
| 44481.552083333336 | 68.3 |
| 44481.5625 | 69.9 |
| 44481.572916666664 | 71.3 |
| 44481.583333333336 | 73.2 |
| 44481.59375 | 74.6 |
| 44481.604166666664 | 77.7 |
| 44481.614583333336 | 78.8 |
| 44481.625 | 79.1 |
| 44481.635416666664 | 80 |
| 44481.645833333336 | 80.2 |
| 44481.65625 | 80.8 |
| 44481.666666666664 | 81.5 |
| 44481.677083333336 | 82.2 |
| 44481.6875 | 83.7 |
| 44481.697916666664 | 84.1 |
| 44481.708333333336 | 85.1 |
| 44481.71875 | 85.6 |
| 44481.729166666664 | 87.1 |
| 44481.739583333336 | 88.6 |
| 44481.75 | 89.7 |
| 44481.760416666664 | 89.7 |
| 44481.770833333336 | 89.8 |
| 44481.78125 | 89.9 |
| 44481.791666666664 | 90.2 |
| 44481.802083333336 | 91.6 |
| 44481.8125 | 91.7 |
| 44481.822916666664 | 93.7 |
| 44481.833333333336 | 93.5 |
| 44481.84375 | 92.6 |
| 44481.854166666664 | 93.1 |
| 44481.864583333336 | 93.1 |
| 44481.875 | 93.2 |
| 44481.885416666664 | 92.5 |
| 44481.895833333336 | 92.3 |
| 44481.90625 | 93.3 |
| 44481.916666666664 | 92.4 |
| 44481.927083333336 | 90.4 |
| 44481.9375 | 86.1 |
| 44481.947916666664 | 89.4 |
| 44481.958333333336 | 84.9 |
| 44481.96875 | 83.7 |
| 44481.979166666664 | 82.2 |
| 44481.989583333336 | 81.5 |
| 44482.0 | 83.1 |
| 44482.010416666664 | 80.4 |
| 44482.020833333336 | 81.7 |
| 44482.03125 | 79.4 |
| 44482.041666666664 | 82.5 |
| 44482.052083333336 | 82.7 |
| 44482.0625 | 75.3 |
| 44482.072916666664 | 66.9 |
| 44482.083333333336 | 63.8 |
| 44482.09375 | 69.7 |
| 44482.104166666664 | 76.3 |
| 44482.114583333336 | 78.4 |
| 44482.125 | 78.6 |
| 44482.135416666664 | 78.4 |
| 44482.145833333336 | 79.5 |
| 44482.15625 | 78.8 |
| 44482.166666666664 | 77.6 |
| 44482.177083333336 | 79.7 |
| 44482.1875 | 79.4 |
| 44482.197916666664 | 79.6 |
| 44482.208333333336 | 79.5 |
| 44482.21875 | 79.8 |
| 44482.229166666664 | 78.7 |
| 44482.239583333336 | 78.2 |
| 44482.25 | 77.5 |
| 44482.260416666664 | 77.5 |
| 44482.270833333336 | 76.1 |
| 44482.28125 | 75.5 |
| 44482.291666666664 | 74.9 |
| 44482.302083333336 | 70.5 |
| 44482.3125 | 76.7 |
| 44482.322916666664 | 77 |
| 44482.333333333336 | 74.5 |
| 44482.34375 | 75.9 |
| 44482.354166666664 | 77.9 |
| 44482.364583333336 | 72.5 |
| 44482.375 | 69.4 |
| 44482.385416666664 | 70.7 |
| 44482.395833333336 | 68.7 |
| 44482.40625 | 66.4 |
| 44482.416666666664 | 65 |
| 44482.427083333336 | 62.2 |
| 44482.4375 | 61.2 |
| 44482.447916666664 | 61.2 |
| 44482.458333333336 | 66.4 |
| 44482.46875 | 60.9 |
| 44482.479166666664 | 63.5 |
| 44482.489583333336 | 64.7 |
| 44482.5 | 61.7 |
| 44482.510416666664 | 63.2 |
| 44482.520833333336 | 64.5 |
| 44482.53125 | 66.1 |
| 44482.541666666664 | 66.9 |
| 44482.552083333336 | 67.7 |
| 44482.5625 | 65.3 |
| 44482.572916666664 | 65.2 |
| 44482.583333333336 | 66 |
| 44482.59375 | 66.7 |
| 44482.604166666664 | 67.6 |
| 44482.614583333336 | 69.1 |
| 44482.625 | 70.7 |
| 44482.635416666664 | 73.3 |
| 44482.645833333336 | 78.6 |
| 44482.65625 | 79 |
| 44482.666666666664 | 79.3 |
| 44482.677083333336 | 79.2 |
| 44482.6875 | 80.1 |
| 44482.697916666664 | 80.8 |
| 44482.708333333336 | 81.8 |
| 44482.71875 | 82.5 |
| 44482.729166666664 | 83.3 |
| 44482.739583333336 | 84.7 |
| 44482.75 | 85.3 |
| 44482.760416666664 | 85.9 |
| 44482.770833333336 | 86 |
| 44482.78125 | 86.3 |
| 44482.791666666664 | 86.6 |
| 44482.802083333336 | 86.7 |
| 44482.8125 | 86.4 |
| 44482.822916666664 | 86.1 |
| 44482.833333333336 | 86 |
| 44482.84375 | 86 |
| 44482.854166666664 | 86.3 |
| 44482.864583333336 | 86.5 |
| 44482.875 | 86.2 |
| 44482.885416666664 | 86.6 |
| 44482.895833333336 | 86.6 |
| 44482.90625 | 86.3 |
| 44482.916666666664 | 85.7 |
| 44482.927083333336 | 84.8 |
| 44482.9375 | 83.8 |
| 44482.947916666664 | 82.4 |
| 44482.958333333336 | 81.5 |
| 44482.96875 | 79.9 |
| 44482.979166666664 | 76.7 |
| 44482.989583333336 | 73.5 |
| 44483.0 | 74.6 |
| 44483.010416666664 | 75.4 |
| 44483.020833333336 | 70.5 |
| 44483.03125 | 72.9 |
| 44483.041666666664 | 74.5 |
| 44483.052083333336 | 77.4 |
| 44483.0625 | 74.5 |
| 44483.072916666664 | 75 |
| 44483.083333333336 | 73.5 |
| 44483.09375 | 75.5 |
| 44483.104166666664 | 58.7 |
| 44483.114583333336 | 69.1 |
| 44483.125 | 67.4 |
| 44483.135416666664 | 71 |
| 44483.145833333336 | 71.2 |
| 44483.15625 | 71.6 |
| 44483.166666666664 | 72.8 |
| 44483.177083333336 | 73.5 |
| 44483.1875 | 73.8 |
| 44483.197916666664 | 73.3 |
| 44483.208333333336 | 74 |
| 44483.21875 | 73.8 |
| 44483.229166666664 | 73.8 |
| 44483.239583333336 | 74 |
| 44483.25 | 73.9 |
| 44483.260416666664 | 73.6 |
| 44483.270833333336 | 73.2 |
| 44483.28125 | 73.4 |
| 44483.291666666664 | 73.6 |
| 44483.302083333336 | 72.9 |
| 44483.3125 | 73 |
| 44483.322916666664 | 74.1 |
| 44483.333333333336 | 74.9 |
| 44483.34375 | 75.8 |
| 44483.354166666664 | 75.5 |
| 44483.364583333336 | 75.8 |
| 44483.375 | 74.8 |
| 44483.385416666664 | 72.4 |
| 44483.395833333336 | 71.8 |
| 44483.40625 | 70.6 |
| 44483.416666666664 | 69.8 |
| 44483.427083333336 | 68.3 |
| 44483.4375 | 69.6 |
| 44483.447916666664 | 66.3 |
| 44483.458333333336 | 66.8 |
| 44483.46875 | 55.5 |
| 44483.479166666664 | 65.2 |
| 44483.489583333336 | 61.5 |
| 44483.5 | 62.7 |
| 44483.510416666664 | 63.5 |
| 44483.520833333336 | 62.4 |
| 44483.53125 | 54.9 |
| 44483.541666666664 | 60.2 |
| 44483.552083333336 | 59.7 |
| 44483.5625 | 56.7 |
| 44483.572916666664 | 59.5 |
| 44483.583333333336 | 59.4 |
| 44483.59375 | 59.6 |
| 44483.604166666664 | 61.1 |
| 44483.614583333336 | 59.5 |
| 44483.625 | 59.3 |
| 44483.635416666664 | 59.9 |
| 44483.645833333336 | 61.3 |
| 44483.65625 | 63.3 |
| 44483.666666666664 | 64.5 |
| 44483.677083333336 | 69.1 |
| 44483.6875 | 73.2 |
| 44483.697916666664 | 77.3 |
| 44483.708333333336 | 79.1 |
| 44483.71875 | 80.5 |
| 44483.729166666664 | 82.1 |
| 44483.739583333336 | 84.6 |
| 44483.75 | 85.3 |
| 44483.760416666664 | 86.3 |
| 44483.770833333336 | 87.2 |
| 44483.78125 | 88.7 |
| 44483.791666666664 | 89.3 |
| 44483.802083333336 | 89 |
| 44483.8125 | 88.4 |
| 44483.822916666664 | 87.7 |
| 44483.833333333336 | 86.9 |
| 44483.84375 | 86.3 |
| 44483.854166666664 | 85.9 |
| 44483.864583333336 | 85.4 |
| 44483.875 | 84.9 |
| 44483.885416666664 | 84.1 |
| 44483.895833333336 | 85.4 |
| 44483.90625 | 86.1 |
| 44483.916666666664 | 87 |
| 44483.927083333336 | 88.5 |
| 44483.9375 | 91.1 |
| 44483.947916666664 | 88.9 |
| 44483.958333333336 | 87.2 |
| 44483.96875 | 86.7 |
| 44483.979166666664 | 87.4 |
| 44483.989583333336 | 85.6 |
| 44484.0 | 83.8 |
| 44484.010416666664 | 82.7 |
| 44484.020833333336 | 79.8 |
| 44484.03125 | 74.3 |
| 44484.041666666664 | 76.8 |
| 44484.052083333336 | 77.1 |
| 44484.0625 | 77.9 |
| 44484.072916666664 | 77.9 |
| 44484.083333333336 | 79.4 |
| 44484.09375 | 71 |
| 44484.104166666664 | 70.9 |
| 44484.114583333336 | 66.7 |
| 44484.125 | 72.6 |
| 44484.135416666664 | 77.6 |
| 44484.145833333336 | 70.7 |
| 44484.15625 | 71 |
| 44484.166666666664 | 72.5 |
| 44484.177083333336 | 73.8 |
| 44484.1875 | 74.6 |
| 44484.197916666664 | 75.7 |
| 44484.208333333336 | 76.1 |
| 44484.21875 | 76.2 |
| 44484.229166666664 | 75 |
| 44484.239583333336 | 75.1 |
| 44484.25 | 75.5 |
| 44484.260416666664 | 76.1 |
| 44484.270833333336 | 76 |
| 44484.28125 | 76 |
| 44484.291666666664 | 75.9 |
| 44484.302083333336 | 76 |
| 44484.3125 | 75.4 |
| 44484.322916666664 | 75.6 |
| 44484.333333333336 | 75.6 |
| 44484.34375 | 75.5 |
| 44484.354166666664 | 75.2 |
| 44484.364583333336 | 74.8 |
| 44484.375 | 75.6 |
| 44484.385416666664 | 75.8 |
| 44484.395833333336 | 75.6 |
| 44484.40625 | 74.6 |
| 44484.416666666664 | 75.4 |
| 44484.427083333336 | 75 |
| 44484.4375 | 74.4 |
| 44484.447916666664 | 71.6 |
| 44484.458333333336 | 57.8 |
| 44484.46875 | 70.9 |
| 44484.479166666664 | 68.5 |
| 44484.489583333336 | 68.3 |
| 44484.5 | 65.3 |
| 44484.510416666664 | 50.4 |
| 44484.520833333336 | 60.5 |
| 44484.53125 | 60.5 |
| 44484.541666666664 | 67 |
| 44484.552083333336 | 66.4 |
| 44484.5625 | 66.3 |
| 44484.572916666664 | 61.9 |
| 44484.583333333336 | 62.4 |
| 44484.59375 | 64.1 |
| 44484.604166666664 | 64.9 |
| 44484.614583333336 | 68.1 |
| 44484.625 | 68.3 |
| 44484.635416666664 | 69.1 |
| 44484.645833333336 | 70 |
| 44484.65625 | 66.5 |
| 44484.666666666664 | 66.2 |
| 44484.677083333336 | 67.1 |
| 44484.6875 | 69.9 |
| 44484.697916666664 | 71.3 |
| 44484.708333333336 | 72.7 |
| 44484.71875 | 77.2 |
| 44484.729166666664 | 81.3 |
| 44484.739583333336 | 83.9 |
| 44484.75 | 85 |
| 44484.760416666664 | 86.6 |
| 44484.770833333336 | 88.2 |
| 44484.78125 | 91.2 |
| 44484.791666666664 | 91.8 |
| 44484.802083333336 | 93.2 |
| 44484.8125 | 93.7 |
| 44484.822916666664 | 93.5 |
| 44484.833333333336 | 94.2 |
| 44484.84375 | 93 |
| 44484.854166666664 | 91.8 |
| 44484.864583333336 | 90.3 |
| 44484.875 | 89.6 |
| 44484.885416666664 | 88.7 |
| 44484.895833333336 | 88.1 |
| 44484.90625 | 87.7 |
| 44484.916666666664 | 87.4 |
| 44484.927083333336 | 86.4 |
| 44484.9375 | 87.6 |
| 44484.947916666664 | 83.4 |
| 44484.958333333336 | 84 |
| 44484.96875 | 84.1 |
| 44484.979166666664 | 86.7 |
| 44484.989583333336 | 85.3 |
| 44485.0 | 86.6 |
| 44485.010416666664 | 86.3 |
| 44485.020833333336 | 84.8 |
| 44485.03125 | 83.1 |
| 44485.041666666664 | 81.7 |
| 44485.052083333336 | 81.6 |
| 44485.0625 | 81 |
| 44485.072916666664 | 76.4 |
| 44485.083333333336 | 78.1 |
| 44485.09375 | 79.6 |
| 44485.104166666664 | 79 |
| 44485.114583333336 | 81.5 |
| 44485.125 | 76.6 |
| 44485.135416666664 | 78.2 |
| 44485.145833333336 | 81.4 |
| 44485.15625 | 70 |
| 44485.166666666664 | 80.9 |
| 44485.177083333336 | 80.4 |
| 44485.1875 | 69.8 |
| 44485.197916666664 | 70.9 |
| 44485.208333333336 | 73.8 |
| 44485.21875 | 75 |
| 44485.229166666664 | 75.2 |
| 44485.239583333336 | 76.2 |
| 44485.25 | 77.1 |
| 44485.260416666664 | 76.3 |
| 44485.270833333336 | 76.4 |
| 44485.28125 | 76.4 |
| 44485.291666666664 | 76.3 |
| 44485.302083333336 | 76.5 |
| 44485.3125 | 76.3 |
| 44485.322916666664 | 76.6 |
| 44485.333333333336 | 76.3 |
| 44485.34375 | 76.5 |
| 44485.354166666664 | 76.4 |
| 44485.364583333336 | 76.8 |
| 44485.375 | 76.4 |
| 44485.385416666664 | 77.3 |
| 44485.395833333336 | 77 |
| 44485.40625 | 77 |
| 44485.416666666664 | 77 |
| 44485.427083333336 | 77 |
| 44485.4375 | 77.5 |
| 44485.447916666664 | 76.5 |
| 44485.458333333336 | 77.4 |
| 44485.46875 | 77.2 |
| 44485.479166666664 | 76.3 |
| 44485.489583333336 | 76.8 |
| 44485.5 | 75.8 |
| 44485.510416666664 | 74.4 |
| 44485.520833333336 | 74.4 |
| 44485.53125 | 74.4 |
| 44485.541666666664 | 72.3 |
| 44485.552083333336 | 74.4 |
| 44485.5625 | 74.4 |
| 44485.572916666664 | 74.8 |
| 44485.583333333336 | 77.2 |
| 44485.59375 | 78.1 |
| 44485.604166666664 | 79.5 |
| 44485.614583333336 | 79 |
| 44485.625 | 83.1 |
| 44485.635416666664 | 83.9 |
| 44485.645833333336 | 85.2 |
| 44485.65625 | 85.7 |
| 44485.666666666664 | 87 |
| 44485.677083333336 | 88.1 |
| 44485.6875 | 87.4 |
| 44485.697916666664 | 84.3 |
| 44485.708333333336 | 82.9 |
| 44485.71875 | 83.5 |
| 44485.729166666664 | 85 |
| 44485.739583333336 | 85.2 |
| 44485.75 | 88.3 |
| 44485.760416666664 | 91.8 |
| 44485.770833333336 | 96 |
| 44485.78125 | 97.3 |
| 44485.791666666664 | 100.6 |
| 44485.802083333336 | 103.2 |
| 44485.8125 | 104.5 |
| 44485.822916666664 | 104.6 |
| 44485.833333333336 | 104.5 |
| 44485.84375 | 104.3 |
| 44485.854166666664 | 104.2 |
| 44485.864583333336 | 104.4 |
| 44485.875 | 103.8 |
| 44485.885416666664 | 103 |
| 44485.895833333336 | 101.9 |
| 44485.90625 | 100.8 |
| 44485.916666666664 | 99.6 |
| 44485.927083333336 | 98.4 |
| 44485.9375 | 97.1 |
| 44485.947916666664 | 95 |
| 44485.958333333336 | 94.6 |
| 44485.96875 | 93.3 |
| 44485.979166666664 | 94.5 |
| 44485.989583333336 | 93.8 |
| 44486.0 | 93.9 |
| 44486.010416666664 | 92.8 |
| 44486.020833333336 | 93.1 |
| 44486.03125 | 90.8 |
| 44486.041666666664 | 91.3 |
| 44486.052083333336 | 90.5 |
| 44486.0625 | 87.9 |
| 44486.072916666664 | 84.4 |
| 44486.083333333336 | 82.3 |
| 44486.09375 | 78.5 |
| 44486.104166666664 | 74.9 |
| 44486.114583333336 | 76.4 |
| 44486.125 | 75.8 |
| 44486.135416666664 | 79.4 |
| 44486.145833333336 | 80.3 |
| 44486.15625 | 80.1 |
| 44486.166666666664 | 78.9 |
| 44486.177083333336 | 80.8 |
| 44486.1875 | 81.9 |
| 44486.197916666664 | 77.4 |
| 44486.208333333336 | 75.6 |
| 44486.21875 | 79.5 |
| 44486.229166666664 | 80 |
| 44486.239583333336 | 79.9 |
| 44486.25 | 80 |
| 44486.260416666664 | 79.4 |
| 44486.270833333336 | 79.6 |
| 44486.28125 | 79.3 |
| 44486.291666666664 | 78.2 |
| 44486.302083333336 | 79.1 |
| 44486.3125 | 80.3 |
| 44486.322916666664 | 80.8 |
| 44486.333333333336 | 80.8 |
| 44486.34375 | 81.1 |
| 44486.354166666664 | 81.6 |
| 44486.364583333336 | 82 |
| 44486.375 | 82.1 |
| 44486.385416666664 | 82.3 |
| 44486.395833333336 | 82.4 |
| 44486.40625 | 82.6 |
| 44486.416666666664 | 82.2 |
| 44486.427083333336 | 82 |
| 44486.4375 | 81.9 |
| 44486.447916666664 | 81.1 |
| 44486.458333333336 | 81.9 |
| 44486.46875 | 82.1 |
| 44486.479166666664 | 82.8 |
| 44486.489583333336 | 82.8 |
| 44486.5 | 82.5 |
| 44486.510416666664 | 83.1 |
| 44486.520833333336 | 80.7 |
| 44486.53125 | 80.6 |
| 44486.541666666664 | 80.2 |
| 44486.552083333336 | 79.1 |
| 44486.5625 | 78 |
| 44486.572916666664 | 78.2 |
| 44486.583333333336 | 78.2 |
| 44486.59375 | 78.5 |
| 44486.604166666664 | 79.6 |
| 44486.614583333336 | 81.8 |
| 44486.625 | 84.6 |
| 44486.635416666664 | 86.2 |
| 44486.645833333336 | 88.6 |
| 44486.65625 | 90.8 |
| 44486.666666666664 | 92.4 |
| 44486.677083333336 | 93.9 |
| 44486.6875 | 94.3 |
| 44486.697916666664 | 95 |
| 44486.708333333336 | 95.6 |
| 44486.71875 | 90.6 |
| 44486.729166666664 | 92.5 |
| 44486.739583333336 | 91.2 |
| 44486.75 | 93.2 |
| 44486.760416666664 | 92.1 |
| 44486.770833333336 | 91.3 |
| 44486.78125 | 90.9 |
| 44486.791666666664 | 90.9 |
| 44486.802083333336 | 91.7 |
| 44486.8125 | 93.3 |
| 44486.822916666664 | 95.2 |
| 44486.833333333336 | 97.2 |
| 44486.84375 | 99.1 |
| 44486.854166666664 | 99.5 |
| 44486.864583333336 | 100.2 |
| 44486.875 | 101.3 |
| 44486.885416666664 | 102.7 |
| 44486.895833333336 | 102.8 |
| 44486.90625 | 101.8 |
| 44486.916666666664 | 100.6 |
| 44486.927083333336 | 99.2 |
| 44486.9375 | 97.5 |
| 44486.947916666664 | 95.8 |
| 44486.958333333336 | 94.2 |
| 44486.96875 | 93 |
| 44486.979166666664 | 92.6 |
| 44486.989583333336 | 92.5 |
| 44487.0 | 91.7 |
| 44487.010416666664 | 92.1 |
| 44487.020833333336 | 92.6 |
| 44487.03125 | 92.6 |
| 44487.041666666664 | 92.6 |
| 44487.052083333336 | 92.7 |
| 44487.0625 | 90.7 |
| 44487.072916666664 | 90.4 |
| 44487.083333333336 | 89.5 |
| 44487.09375 | 88.1 |
| 44487.104166666664 | 86.7 |
| 44487.114583333336 | 83.8 |
| 44487.125 | 84.2 |
| 44487.135416666664 | 83.9 |
| 44487.145833333336 | 83.3 |
| 44487.15625 | 84 |
| 44487.166666666664 | 83.1 |
| 44487.177083333336 | 84.6 |
| 44487.1875 | 82.8 |
| 44487.197916666664 | 85 |
| 44487.208333333336 | 83 |
| 44487.21875 | 84 |
| 44487.229166666664 | 84.8 |
| 44487.239583333336 | 84.6 |
| 44487.25 | 86 |
| 44487.260416666664 | 83.3 |
| 44487.270833333336 | 80 |
| 44487.28125 | 82.2 |
| 44487.291666666664 | 82.4 |
| 44487.302083333336 | 82.4 |
| 44487.3125 | 82.4 |
| 44487.322916666664 | 82.3 |
| 44487.333333333336 | 81.9 |
| 44487.34375 | 81.4 |
| 44487.354166666664 | 81.7 |
| 44487.364583333336 | 81.9 |
| 44487.375 | 81.7 |
| 44487.385416666664 | 81.8 |
| 44487.395833333336 | 81.8 |
| 44487.40625 | 82.2 |
| 44487.416666666664 | 82.8 |
| 44487.427083333336 | 82.7 |
| 44487.4375 | 82.7 |
| 44487.447916666664 | 82.4 |
| 44487.458333333336 | 82.1 |
| 44487.46875 | 82.2 |
| 44487.479166666664 | 82.8 |
| 44487.489583333336 | 82.9 |
| 44487.5 | 82.9 |
| 44487.510416666664 | 82.7 |
| 44487.520833333336 | 82.3 |
| 44487.53125 | 83.2 |
| 44487.541666666664 | 82.9 |
| 44487.552083333336 | 82.9 |
| 44487.5625 | 83.3 |
| 44487.572916666664 | 82.3 |
| 44487.583333333336 | 82.8 |
| 44487.59375 | 83.5 |
| 44487.604166666664 | 84.2 |
| 44487.614583333336 | 85.2 |
| 44487.625 | 86.6 |
| 44487.635416666664 | 88.9 |
| 44487.645833333336 | 90.9 |
| 44487.65625 | 92.7 |
| 44487.666666666664 | 94.3 |
| 44487.677083333336 | 95.7 |
| 44487.6875 | 96.8 |
| 44487.697916666664 | 97.8 |
| 44487.708333333336 | 98.5 |
| 44487.71875 | 99 |
| 44487.729166666664 | 98.4 |
| 44487.739583333336 | 99.5 |
| 44487.75 | 99.8 |
| 44487.760416666664 | 98.1 |
| 44487.770833333336 | 95.6 |
| 44487.78125 | 97.4 |
| 44487.791666666664 | 96.8 |
| 44487.802083333336 | 96.6 |
| 44487.8125 | 96.4 |
| 44487.822916666664 | 96.5 |
| 44487.833333333336 | 96.9 |
| 44487.84375 | 98.3 |
| 44487.854166666664 | 100.8 |
| 44487.864583333336 | 102.7 |
| 44487.875 | 103.4 |
| 44487.885416666664 | 103.6 |
| 44487.895833333336 | 102.6 |
| 44487.90625 | 101.5 |
| 44487.916666666664 | 100.1 |
| 44487.927083333336 | 98.8 |
| 44487.9375 | 97.5 |
| 44487.947916666664 | 96.2 |
| 44487.958333333336 | 95.3 |
| 44487.96875 | 94.3 |
| 44487.979166666664 | 93.5 |
| 44487.989583333336 | 92.9 |
| 44488.0 | 92.3 |
| 44488.010416666664 | 91.7 |
| 44488.020833333336 | 91.2 |
| 44488.03125 | 92.2 |
| 44488.041666666664 | 91.8 |
| 44488.052083333336 | 91.2 |
| 44488.0625 | 90.6 |
| 44488.072916666664 | 91.1 |
| 44488.083333333336 | 90 |
| 44488.09375 | 90.2 |
| 44488.104166666664 | 90 |
| 44488.114583333336 | 89 |
| 44488.125 | 88.8 |
| 44488.135416666664 | 87.8 |
| 44488.145833333336 | 88.7 |
| 44488.15625 | 87.9 |
| 44488.166666666664 | 87.9 |
| 44488.177083333336 | 87.6 |
| 44488.1875 | 86.6 |
| 44488.197916666664 | 86.8 |
| 44488.208333333336 | 85.4 |
| 44488.21875 | 85.3 |
| 44488.229166666664 | 85 |
| 44488.239583333336 | 84.4 |
| 44488.25 | 84.5 |
| 44488.260416666664 | 85.4 |
| 44488.270833333336 | 86.3 |
| 44488.28125 | 84 |
| 44488.291666666664 | 81.8 |
| 44488.302083333336 | 83.8 |
| 44488.3125 | 83.6 |
| 44488.322916666664 | 83.7 |
| 44488.333333333336 | 83.8 |
| 44488.34375 | 83.4 |
| 44488.354166666664 | 83.1 |
| 44488.364583333336 | 82.9 |
| 44488.375 | 83.1 |
| 44488.385416666664 | 82.8 |
| 44488.395833333336 | 82.3 |
| 44488.40625 | 81.9 |
| 44488.416666666664 | 81.6 |
| 44488.427083333336 | 81.7 |
| 44488.4375 | 81.7 |
| 44488.447916666664 | 81.6 |
| 44488.458333333336 | 81.6 |
| 44488.46875 | 81.6 |
| 44488.479166666664 | 81.5 |
| 44488.489583333336 | 81.5 |
| 44488.5 | 81.3 |
| 44488.510416666664 | 81.7 |
| 44488.520833333336 | 81.3 |
| 44488.53125 | 81.3 |
| 44488.541666666664 | 81.7 |
| 44488.552083333336 | 81.9 |
| 44488.5625 | 82.1 |
| 44488.572916666664 | 82.4 |
| 44488.583333333336 | 82.7 |
| 44488.59375 | 82.6 |
| 44488.604166666664 | 83.4 |
| 44488.614583333336 | 83.9 |
| 44488.625 | 84.9 |
| 44488.635416666664 | 86.8 |
| 44488.645833333336 | 87.3 |
| 44488.65625 | 89.4 |
| 44488.666666666664 | 91.4 |
| 44488.677083333336 | 94.3 |
| 44488.6875 | 96.1 |
| 44488.697916666664 | 98.4 |
| 44488.708333333336 | 100 |
| 44488.71875 | 100.6 |
| 44488.729166666664 | 100.5 |
| 44488.739583333336 | 101.6 |
| 44488.75 | 101.9 |
| 44488.760416666664 | 101.9 |
| 44488.770833333336 | 101.7 |
| 44488.78125 | 102.4 |
| 44488.791666666664 | 100 |
| 44488.802083333336 | 99 |
| 44488.8125 | 99.9 |
| 44488.822916666664 | 99.1 |
| 44488.833333333336 | 98.7 |
| 44488.84375 | 99.1 |
| 44488.854166666664 | 99.1 |
| 44488.864583333336 | 100.3 |
| 44488.875 | 101.2 |
| 44488.885416666664 | 102.3 |
| 44488.895833333336 | 103.3 |
| 44488.90625 | 104.3 |
| 44488.916666666664 | 105 |
| 44488.927083333336 | 104.3 |
| 44488.9375 | 103.7 |
| 44488.947916666664 | 102.6 |
| 44488.958333333336 | 101.7 |
| 44488.96875 | 100.4 |
| 44488.979166666664 | 98.9 |
| 44488.989583333336 | 97.8 |
| 44489.0 | 96.8 |
| 44489.010416666664 | 95.7 |
| 44489.020833333336 | 95 |
| 44489.03125 | 94.6 |
| 44489.041666666664 | 93.8 |
| 44489.052083333336 | 93.3 |
| 44489.0625 | 93.3 |
| 44489.072916666664 | 94 |
| 44489.083333333336 | 93.8 |
| 44489.09375 | 93.1 |
| 44489.104166666664 | 92.7 |
| 44489.114583333336 | 91.7 |
| 44489.125 | 92 |
| 44489.135416666664 | 91.3 |
| 44489.145833333336 | 91 |
| 44489.15625 | 90.7 |
| 44489.166666666664 | 93.2 |
| 44489.177083333336 | 92.2 |
| 44489.1875 | 91.2 |
| 44489.197916666664 | 89.9 |
| 44489.208333333336 | 88.8 |
| 44489.21875 | 87.5 |
| 44489.229166666664 | 86.7 |
| 44489.239583333336 | 86.3 |
| 44489.25 | 86.4 |
| 44489.260416666664 | 86.5 |
| 44489.270833333336 | 85.9 |
| 44489.28125 | 85.9 |
| 44489.291666666664 | 85.5 |
| 44489.302083333336 | 85.2 |
| 44489.3125 | 86 |
| 44489.322916666664 | 84.6 |
| 44489.333333333336 | 85.1 |
| 44489.34375 | 84.9 |
| 44489.354166666664 | 85.2 |
| 44489.364583333336 | 84.7 |
| 44489.375 | 84.7 |
| 44489.385416666664 | 84.5 |
| 44489.395833333336 | 84.2 |
| 44489.40625 | 84.1 |
| 44489.416666666664 | 83.9 |
| 44489.427083333336 | 83.8 |
| 44489.4375 | 83.3 |
| 44489.447916666664 | 83 |
| 44489.458333333336 | 82.9 |
| 44489.46875 | 83 |
| 44489.479166666664 | 83 |
| 44489.489583333336 | 83.1 |
| 44489.5 | 83 |
| 44489.510416666664 | 82.9 |
| 44489.520833333336 | 82.8 |
| 44489.53125 | 82.7 |
| 44489.541666666664 | 82.7 |
| 44489.552083333336 | 82.8 |
| 44489.5625 | 82.8 |
| 44489.572916666664 | 83.1 |
| 44489.583333333336 | 83.8 |
| 44489.59375 | 84.4 |
| 44489.604166666664 | 84.8 |
| 44489.614583333336 | 85.9 |
| 44489.625 | 87.2 |
| 44489.635416666664 | 87.5 |
| 44489.645833333336 | 89.4 |
| 44489.65625 | 90.9 |
| 44489.666666666664 | 92.1 |
| 44489.677083333336 | 95.3 |
| 44489.6875 | 97.4 |
| 44489.697916666664 | 98.7 |
| 44489.708333333336 | 100.8 |
| 44489.71875 | 101.4 |
| 44489.729166666664 | 99.6 |
| 44489.739583333336 | 102.1 |
| 44489.75 | 101.9 |
| 44489.760416666664 | 102.6 |
| 44489.770833333336 | 102.4 |
| 44489.78125 | 103.3 |
| 44489.791666666664 | 103.3 |
| 44489.802083333336 | 104 |
| 44489.8125 | 103 |
| 44489.822916666664 | 102.8 |
| 44489.833333333336 | 101 |
| 44489.84375 | 101.4 |
| 44489.854166666664 | 100.1 |
| 44489.864583333336 | 99.7 |
| 44489.875 | 100.4 |
| 44489.885416666664 | 100.8 |
| 44489.895833333336 | 101.7 |
| 44489.90625 | 103 |
| 44489.916666666664 | 105 |
| 44489.927083333336 | 107.9 |
| 44489.9375 | 109 |
| 44489.947916666664 | 109.1 |
| 44489.958333333336 | 108.8 |
| 44489.96875 | 108 |
| 44489.979166666664 | 107.1 |
| 44489.989583333336 | 106 |
| 44490.0 | 104.5 |
| 44490.010416666664 | 103 |
| 44490.020833333336 | 101.7 |
| 44490.03125 | 100.1 |
| 44490.041666666664 | 99.1 |
| 44490.052083333336 | 98.1 |
| 44490.0625 | 97.4 |
| 44490.072916666664 | 96.4 |
| 44490.083333333336 | 96.4 |
| 44490.09375 | 96.3 |
| 44490.104166666664 | 96 |
| 44490.114583333336 | 96.2 |
| 44490.125 | 95.6 |
| 44490.135416666664 | 95 |
| 44490.145833333336 | 93.9 |
| 44490.15625 | 93.4 |
| 44490.166666666664 | 92 |
| 44490.177083333336 | 91.1 |
| 44490.1875 | 92.4 |
| 44490.197916666664 | 90.2 |
| 44490.208333333336 | 92.5 |
| 44490.21875 | 90.6 |
| 44490.229166666664 | 89.6 |
| 44490.239583333336 | 87.9 |
| 44490.25 | 87.8 |
| 44490.260416666664 | 87.3 |
| 44490.270833333336 | 87.3 |
| 44490.28125 | 87.4 |
| 44490.291666666664 | 86.9 |
| 44490.302083333336 | 87.8 |
| 44490.3125 | 88.5 |
| 44490.322916666664 | 86.3 |
| 44490.333333333336 | 86 |
| 44490.34375 | 86.6 |
| 44490.354166666664 | 86.3 |
| 44490.364583333336 | 86 |
| 44490.375 | 86.5 |
| 44490.385416666664 | 86.6 |
| 44490.395833333336 | 86.6 |
| 44490.40625 | 86.6 |
| 44490.416666666664 | 86.6 |
| 44490.427083333336 | 86.5 |
| 44490.4375 | 86.5 |
| 44490.447916666664 | 86.2 |
| 44490.458333333336 | 85.9 |
| 44490.46875 | 85.6 |
| 44490.479166666664 | 85.6 |
| 44490.489583333336 | 85.5 |
| 44490.5 | 85.2 |
| 44490.510416666664 | 84.9 |
| 44490.520833333336 | 84.7 |
| 44490.53125 | 84.7 |
| 44490.541666666664 | 84.7 |
| 44490.552083333336 | 84.8 |
| 44490.5625 | 85.1 |
| 44490.572916666664 | 85.4 |
| 44490.583333333336 | 85.5 |
| 44490.59375 | 85.6 |
| 44490.604166666664 | 86.1 |
| 44490.614583333336 | 87 |
| 44490.625 | 87.8 |
| 44490.635416666664 | 90 |
| 44490.645833333336 | 92.7 |
| 44490.65625 | 92.7 |
| 44490.666666666664 | 95 |
| 44490.677083333336 | 95.7 |
| 44490.6875 | 97.3 |
| 44490.697916666664 | 98.7 |
| 44490.708333333336 | 98.4 |
| 44490.71875 | 100.7 |
| 44490.729166666664 | 102.1 |
| 44490.739583333336 | 104 |
| 44490.75 | 105.8 |
| 44490.760416666664 | 107.9 |
| 44490.770833333336 | 107.7 |
| 44490.78125 | 108.8 |
| 44490.791666666664 | 109.4 |
| 44490.802083333336 | 109.1 |
| 44490.8125 | 109 |
| 44490.822916666664 | 108.5 |
| 44490.833333333336 | 108.5 |
| 44490.84375 | 108.3 |
| 44490.854166666664 | 106.3 |
| 44490.864583333336 | 104.6 |
| 44490.875 | 105.1 |
| 44490.885416666664 | 103.9 |
| 44490.895833333336 | 103.2 |
| 44490.90625 | 102.9 |
| 44490.916666666664 | 102.6 |
| 44490.927083333336 | 102 |
| 44490.9375 | 101.6 |
| 44490.947916666664 | 101.2 |
| 44490.958333333336 | 100.5 |
| 44490.96875 | 100 |
| 44490.979166666664 | 99.8 |
| 44490.989583333336 | 99.5 |
| 44491.0 | 99.5 |
| 44491.010416666664 | 99.5 |
| 44491.020833333336 | 99.4 |
| 44491.03125 | 99.2 |
| 44491.041666666664 | 98.8 |
| 44491.052083333336 | 98.6 |
| 44491.0625 | 98.6 |
| 44491.072916666664 | 98.4 |
| 44491.083333333336 | 98.3 |
| 44491.09375 | 97.4 |
| 44491.104166666664 | 95.4 |
| 44491.114583333336 | 96 |
| 44491.125 | 96.3 |
| 44491.135416666664 | 96 |
| 44491.145833333336 | 94.9 |
| 44491.15625 | 93.2 |
| 44491.166666666664 | 91.4 |
| 44491.177083333336 | 88.3 |
| 44491.1875 | 88 |
| 44491.197916666664 | 85.7 |
| 44491.208333333336 | 88.9 |
| 44491.21875 | 89 |
| 44491.229166666664 | 88.3 |
| 44491.239583333336 | 88.7 |
| 44491.25 | 88.4 |
| 44491.260416666664 | 87.9 |
| 44491.270833333336 | 87.5 |
| 44491.28125 | 87.5 |
| 44491.291666666664 | 87.4 |
| 44491.302083333336 | 86.4 |
| 44491.3125 | 86.5 |
| 44491.322916666664 | 86.6 |
| 44491.333333333336 | 86.7 |
| 44491.34375 | 85.4 |
| 44491.354166666664 | 85.1 |
| 44491.364583333336 | 84.7 |
| 44491.375 | 84.9 |
| 44491.385416666664 | 84.6 |
| 44491.395833333336 | 84.4 |
| 44491.40625 | 85.2 |
| 44491.416666666664 | 85.2 |
| 44491.427083333336 | 85.2 |
| 44491.4375 | 85.1 |
| 44491.447916666664 | 85 |
| 44491.458333333336 | 85 |
| 44491.46875 | 84.9 |
| 44491.479166666664 | 85 |
| 44491.489583333336 | 85.1 |
| 44491.5 | 85.3 |
| 44491.510416666664 | 85.8 |
| 44491.520833333336 | 86.3 |
| 44491.53125 | 86.8 |
| 44491.541666666664 | 87 |
| 44491.552083333336 | 87.2 |
| 44491.5625 | 87.4 |
| 44491.572916666664 | 87.4 |
| 44491.583333333336 | 87.4 |
| 44491.59375 | 87.5 |
| 44491.604166666664 | 87.6 |
| 44491.614583333336 | 87.4 |
| 44491.625 | 87.5 |
| 44491.635416666664 | 88.6 |
| 44491.645833333336 | 88.2 |
| 44491.65625 | 88.2 |
| 44491.666666666664 | 89.1 |
| 44491.677083333336 | 88.9 |
| 44491.6875 | 89.7 |
| 44491.697916666664 | 90.1 |
| 44491.708333333336 | 89.5 |
| 44491.71875 | 90.5 |
| 44491.729166666664 | 91.4 |
| 44491.739583333336 | 93 |
| 44491.75 | 94.8 |
| 44491.760416666664 | 95.5 |
| 44491.770833333336 | 96.9 |
| 44491.78125 | 98.2 |
| 44491.791666666664 | 99 |
| 44491.802083333336 | 99 |
| 44491.8125 | 99.9 |
| 44491.822916666664 | 99.4 |
| 44491.833333333336 | 99.2 |
| 44491.84375 | 97.9 |
| 44491.854166666664 | 95.9 |
| 44491.864583333336 | 94.7 |
| 44491.875 | 94.6 |
| 44491.885416666664 | 93.4 |
| 44491.895833333336 | 92.5 |
| 44491.90625 | 92.4 |
| 44491.916666666664 | 92 |
| 44491.927083333336 | 92.6 |
| 44491.9375 | 94.1 |
| 44491.947916666664 | 94.1 |
| 44491.958333333336 | 94.8 |
| 44491.96875 | 94.7 |
| 44491.979166666664 | 94.7 |
| 44491.989583333336 | 94.6 |
| 44492.0 | 94.6 |
| 44492.010416666664 | 94.6 |
| 44492.020833333336 | 94.5 |
| 44492.03125 | 94.8 |
| 44492.041666666664 | 94.8 |
| 44492.052083333336 | 94.8 |
| 44492.0625 | 94.6 |
| 44492.072916666664 | 94.7 |
| 44492.083333333336 | 94.5 |
| 44492.09375 | 94.2 |
| 44492.104166666664 | 93.4 |
| 44492.114583333336 | 92.8 |
| 44492.125 | 92.1 |
| 44492.135416666664 | 92.2 |
| 44492.145833333336 | 91.6 |
| 44492.15625 | 92.5 |
| 44492.166666666664 | 90.4 |
| 44492.177083333336 | 88.3 |
| 44492.1875 | 86.5 |
| 44492.197916666664 | 84.6 |
| 44492.208333333336 | 82.9 |
| 44492.21875 | 82.7 |
| 44492.229166666664 | 81.1 |
| 44492.239583333336 | 81.4 |
| 44492.25 | 82.3 |
| 44492.260416666664 | 84.2 |
| 44492.270833333336 | 81.3 |
| 44492.28125 | 82.6 |
| 44492.291666666664 | 81.3 |
| 44492.302083333336 | 81.1 |
| 44492.3125 | 81.1 |
| 44492.322916666664 | 80.2 |
| 44492.333333333336 | 81.1 |
| 44492.34375 | 81.3 |
| 44492.354166666664 | 80.7 |
| 44492.364583333336 | 80.6 |
| 44492.375 | 78.1 |
| 44492.385416666664 | 77.2 |
| 44492.395833333336 | 77.9 |
| 44492.40625 | 78.3 |
| 44492.416666666664 | 78.7 |
| 44492.427083333336 | 78.9 |
| 44492.4375 | 79.4 |
| 44492.447916666664 | 80.2 |
| 44492.458333333336 | 81.1 |
| 44492.46875 | 81.3 |
| 44492.479166666664 | 81.7 |
| 44492.489583333336 | 81.4 |
| 44492.5 | 81.5 |
| 44492.510416666664 | 81.7 |
| 44492.520833333336 | 81.8 |
| 44492.53125 | 81.7 |
| 44492.541666666664 | 82 |
| 44492.552083333336 | 82.1 |
| 44492.5625 | 82.1 |
| 44492.572916666664 | 82.1 |
| 44492.583333333336 | 82.8 |
| 44492.59375 | 83.2 |
| 44492.604166666664 | 83.5 |
| 44492.614583333336 | 83.6 |
| 44492.625 | 83.8 |
| 44492.635416666664 | 84.5 |
| 44492.645833333336 | 84.9 |
| 44492.65625 | 85.3 |
| 44492.666666666664 | 85.7 |
| 44492.677083333336 | 86.4 |
| 44492.6875 | 88.9 |
| 44492.697916666664 | 90.8 |
| 44492.708333333336 | 93 |
| 44492.71875 | 92.6 |
| 44492.729166666664 | 92.9 |
| 44492.739583333336 | 92.5 |
| 44492.75 | 95 |
| 44492.760416666664 | 95.9 |
| 44492.770833333336 | 98.4 |
| 44492.78125 | 99.9 |
| 44492.791666666664 | 100 |
| 44492.802083333336 | 101.9 |
| 44492.8125 | 102.9 |
| 44492.822916666664 | 103.9 |
| 44492.833333333336 | 104.8 |
| 44492.84375 | 103.8 |
| 44492.854166666664 | 104.4 |
| 44492.864583333336 | 103.3 |
| 44492.875 | 102.5 |
| 44492.885416666664 | 101.6 |
| 44492.895833333336 | 100.5 |
| 44492.90625 | 99.5 |
| 44492.916666666664 | 98.1 |
| 44492.927083333336 | 96.4 |
| 44492.9375 | 96.3 |
| 44492.947916666664 | 96 |
| 44492.958333333336 | 95.9 |
| 44492.96875 | 96.2 |
| 44492.979166666664 | 96.4 |
| 44492.989583333336 | 95.4 |
| 44493.0 | 94.7 |
| 44493.010416666664 | 94.5 |
| 44493.020833333336 | 94.2 |
| 44493.03125 | 93.6 |
| 44493.041666666664 | 93.2 |
| 44493.052083333336 | 92.9 |
| 44493.0625 | 92.6 |
| 44493.072916666664 | 92.1 |
| 44493.083333333336 | 91.7 |
| 44493.09375 | 91.7 |
| 44493.104166666664 | 91.1 |
| 44493.114583333336 | 90.8 |
| 44493.125 | 90.3 |
| 44493.135416666664 | 89.9 |
| 44493.145833333336 | 89 |
| 44493.15625 | 88.5 |
| 44493.166666666664 | 87.7 |
| 44493.177083333336 | 89.3 |
| 44493.1875 | 87.7 |
| 44493.197916666664 | 86.9 |
| 44493.208333333336 | 86.4 |
| 44493.21875 | 85.5 |
| 44493.229166666664 | 83.1 |
| 44493.239583333336 | 83.8 |
| 44493.25 | 82.9 |
| 44493.260416666664 | 83.4 |
| 44493.270833333336 | 85 |
| 44493.28125 | 84.1 |
| 44493.291666666664 | 84 |
| 44493.302083333336 | 83.9 |
| 44493.3125 | 83 |
| 44493.322916666664 | 82 |
| 44493.333333333336 | 82.4 |
| 44493.34375 | 81.7 |
| 44493.354166666664 | 81.7 |
| 44493.364583333336 | 81.3 |
| 44493.375 | 81.4 |
| 44493.385416666664 | 81.4 |
| 44493.395833333336 | 81.1 |
| 44493.40625 | 81.1 |
| 44493.416666666664 | 78.2 |
| 44493.427083333336 | 77.7 |
| 44493.4375 | 78.2 |
| 44493.447916666664 | 78.7 |
| 44493.458333333336 | 79 |
| 44493.46875 | 79.7 |
| 44493.479166666664 | 80.1 |
| 44493.489583333336 | 80.7 |
| 44493.5 | 80.9 |
| 44493.510416666664 | 80.8 |
| 44493.520833333336 | 80.8 |
| 44493.53125 | 80.7 |
| 44493.541666666664 | 80.5 |
| 44493.552083333336 | 80.5 |
| 44493.5625 | 80.8 |
| 44493.572916666664 | 81.2 |
| 44493.583333333336 | 81.6 |
| 44493.59375 | 81.7 |
| 44493.604166666664 | 82.3 |
| 44493.614583333336 | 83.3 |
| 44493.625 | 83.1 |
| 44493.635416666664 | 84.8 |
| 44493.645833333336 | 84.9 |
| 44493.65625 | 85.5 |
| 44493.666666666664 | 86 |
| 44493.677083333336 | 86.4 |
| 44493.6875 | 86.8 |
| 44493.697916666664 | 88 |
| 44493.708333333336 | 91 |
| 44493.71875 | 92.9 |
| 44493.729166666664 | 94.6 |
| 44493.739583333336 | 95.8 |
| 44493.75 | 97.2 |
| 44493.760416666664 | 98 |
| 44493.770833333336 | 98.7 |
| 44493.78125 | 99.8 |
| 44493.791666666664 | 100.9 |
| 44493.802083333336 | 101.4 |
| 44493.8125 | 102.8 |
| 44493.822916666664 | 104.6 |
| 44493.833333333336 | 105.3 |
| 44493.84375 | 106.9 |
| 44493.854166666664 | 108 |
| 44493.864583333336 | 107.9 |
| 44493.875 | 107.8 |
| 44493.885416666664 | 106.9 |
| 44493.895833333336 | 106.9 |
| 44493.90625 | 106.1 |
| 44493.916666666664 | 105.5 |
| 44493.927083333336 | 105.1 |
| 44493.9375 | 102.4 |
| 44493.947916666664 | 99.5 |
| 44493.958333333336 | 99.3 |
| 44493.96875 | 99.5 |
| 44493.979166666664 | 99.2 |
| 44493.989583333336 | 98.1 |
| 44494.0 | 97.4 |
| 44494.010416666664 | 96.7 |
| 44494.020833333336 | 95.5 |
| 44494.03125 | 94.7 |
| 44494.041666666664 | 93.9 |
| 44494.052083333336 | 92.8 |
| 44494.0625 | 92.2 |
| 44494.072916666664 | 91.6 |
| 44494.083333333336 | 90.5 |
| 44494.09375 | 90.1 |
| 44494.104166666664 | 90 |
| 44494.114583333336 | 90.1 |
| 44494.125 | 90.3 |
| 44494.135416666664 | 89.7 |
| 44494.145833333336 | 89.1 |
| 44494.15625 | 89.1 |
| 44494.166666666664 | 88.3 |
| 44494.177083333336 | 88.5 |
| 44494.1875 | 89.7 |
| 44494.197916666664 | 88.6 |
| 44494.208333333336 | 88 |
| 44494.21875 | 87.3 |
| 44494.229166666664 | 86.8 |
| 44494.239583333336 | 85.8 |
| 44494.25 | 82.9 |
| 44494.260416666664 | 82.9 |
| 44494.270833333336 | 81.8 |
| 44494.28125 | 83.6 |
| 44494.291666666664 | 84.4 |
| 44494.302083333336 | 84.4 |
| 44494.3125 | 83.2 |
| 44494.322916666664 | 86.3 |
| 44494.333333333336 | 85.4 |
| 44494.34375 | 85.7 |
| 44494.354166666664 | 85.4 |
| 44494.364583333336 | 85.3 |
| 44494.375 | 84.3 |
| 44494.385416666664 | 84.8 |
| 44494.395833333336 | 84.9 |
| 44494.40625 | 83.8 |
| 44494.416666666664 | 84.4 |
| 44494.427083333336 | 84.2 |
| 44494.4375 | 80.8 |
| 44494.447916666664 | 79.6 |
| 44494.458333333336 | 79.5 |
| 44494.46875 | 80.8 |
| 44494.479166666664 | 81.2 |
| 44494.489583333336 | 81 |
| 44494.5 | 80.9 |
| 44494.510416666664 | 81.4 |
| 44494.520833333336 | 81.7 |
| 44494.53125 | 81.8 |
| 44494.541666666664 | 81.8 |
| 44494.552083333336 | 81.6 |
| 44494.5625 | 81.6 |
| 44494.572916666664 | 81.6 |
| 44494.583333333336 | 81.6 |
| 44494.59375 | 81.7 |
| 44494.604166666664 | 82.3 |
| 44494.614583333336 | 82.3 |
| 44494.625 | 82.4 |
| 44494.635416666664 | 82.9 |
| 44494.645833333336 | 83.7 |
| 44494.65625 | 84.2 |
| 44494.666666666664 | 84.5 |
| 44494.677083333336 | 85.8 |
| 44494.6875 | 86.5 |
| 44494.697916666664 | 85.9 |
| 44494.708333333336 | 86.6 |
| 44494.71875 | 87.9 |
| 44494.729166666664 | 91.1 |
| 44494.739583333336 | 92.7 |
| 44494.75 | 93.3 |
| 44494.760416666664 | 95.2 |
| 44494.770833333336 | 94.3 |
| 44494.78125 | 94.2 |
| 44494.791666666664 | 97.1 |
| 44494.802083333336 | 98.1 |
| 44494.8125 | 98.2 |
| 44494.822916666664 | 98.3 |
| 44494.833333333336 | 98.7 |
| 44494.84375 | 97.5 |
| 44494.854166666664 | 99.1 |
| 44494.864583333336 | 101.3 |
| 44494.875 | 100.2 |
| 44494.885416666664 | 100.5 |
| 44494.895833333336 | 100.1 |
| 44494.90625 | 101.4 |
| 44494.916666666664 | 101 |
| 44494.927083333336 | 101.5 |
| 44494.9375 | 101.3 |
| 44494.947916666664 | 100.9 |
| 44494.958333333336 | 100.6 |
| 44494.96875 | 99.8 |
| 44494.979166666664 | 91.2 |
| 44494.989583333336 | 82.5 |
| 44495.0 | 88.6 |
| 44495.010416666664 | 89.7 |
| 44495.020833333336 | 89.9 |
| 44495.03125 | 88.2 |
| 44495.041666666664 | 87.6 |
| 44495.052083333336 | 86.6 |
| 44495.0625 | 85.7 |
| 44495.072916666664 | 85.9 |
| 44495.083333333336 | 85.3 |
| 44495.09375 | 84.6 |
| 44495.104166666664 | 84 |
| 44495.114583333336 | 83.5 |
| 44495.125 | 83 |
| 44495.135416666664 | 82.6 |
| 44495.145833333336 | 82.4 |
| 44495.15625 | 81.6 |
| 44495.166666666664 | 81 |
| 44495.177083333336 | 81.6 |
| 44495.1875 | 80.7 |
| 44495.197916666664 | 80.2 |
| 44495.208333333336 | 79.8 |
| 44495.21875 | 81.3 |
| 44495.229166666664 | 83.6 |
| 44495.239583333336 | 82.9 |
| 44495.25 | 82.1 |
| 44495.260416666664 | 82.2 |
| 44495.270833333336 | 81 |
| 44495.28125 | 81.1 |
| 44495.291666666664 | 79.7 |
| 44495.302083333336 | 77.6 |
| 44495.3125 | 79.4 |
| 44495.322916666664 | 79.4 |
| 44495.333333333336 | 80.3 |
| 44495.34375 | 81.5 |
| 44495.354166666664 | 80.8 |
| 44495.364583333336 | 78.5 |
| 44495.375 | 79.4 |
| 44495.385416666664 | 79.8 |
| 44495.395833333336 | 81.6 |
| 44495.40625 | 79.2 |
| 44495.416666666664 | 82 |
| 44495.427083333336 | 78.3 |
| 44495.4375 | 78.1 |
| 44495.447916666664 | 77.4 |
| 44495.458333333336 | 77.3 |
| 44495.46875 | 80.1 |
| 44495.479166666664 | 82 |
| 44495.489583333336 | 79.3 |
| 44495.5 | 75.9 |
| 44495.510416666664 | 75.9 |
| 44495.520833333336 | 75 |
| 44495.53125 | 77.9 |
| 44495.541666666664 | 78.4 |
| 44495.552083333336 | 79.3 |
| 44495.5625 | 80.1 |
| 44495.572916666664 | 80.8 |
| 44495.583333333336 | 81.4 |
| 44495.59375 | 81.9 |
| 44495.604166666664 | 82.4 |
| 44495.614583333336 | 83.1 |
| 44495.625 | 83.7 |
| 44495.635416666664 | 84 |
| 44495.645833333336 | 84.5 |
| 44495.65625 | 85.6 |
| 44495.666666666664 | 86.3 |
| 44495.677083333336 | 87.3 |
| 44495.6875 | 88.1 |
| 44495.697916666664 | 88.9 |
| 44495.708333333336 | 89.2 |
| 44495.71875 | 88.7 |
| 44495.729166666664 | 86.8 |
| 44495.739583333336 | 90 |
| 44495.75 | 91.8 |
| 44495.760416666664 | 92.6 |
| 44495.770833333336 | 94.1 |
| 44495.78125 | 95.2 |
| 44495.791666666664 | 97.2 |
| 44495.802083333336 | 97.8 |
| 44495.8125 | 97.3 |
| 44495.822916666664 | 97.1 |
| 44495.833333333336 | 96.9 |
| 44495.84375 | 98.6 |
| 44495.854166666664 | 98 |
| 44495.864583333336 | 97.3 |
| 44495.875 | 96.7 |
| 44495.885416666664 | 97 |
| 44495.895833333336 | 96.8 |
| 44495.90625 | 97.6 |
| 44495.916666666664 | 98.3 |
| 44495.927083333336 | 99.1 |
| 44495.9375 | 99.7 |
| 44495.947916666664 | 100.6 |
| 44495.958333333336 | 100.2 |
| 44495.96875 | 99.7 |
| 44495.979166666664 | 99.1 |
| 44495.989583333336 | 97.5 |
| 44496.0 | 92.3 |
| 44496.010416666664 | 88.2 |
| 44496.020833333336 | 92.6 |
| 44496.03125 | 88.1 |
| 44496.041666666664 | 84.5 |
| 44496.052083333336 | 82.7 |
| 44496.0625 | 85.4 |
| 44496.072916666664 | 87.6 |
| 44496.083333333336 | 84.6 |
| 44496.09375 | 85.8 |
| 44496.104166666664 | 86.5 |
| 44496.114583333336 | 87.1 |
| 44496.125 | 87.4 |
| 44496.135416666664 | 87.8 |
| 44496.145833333336 | 87.4 |
| 44496.15625 | 87.4 |
| 44496.166666666664 | 86.7 |
| 44496.177083333336 | 86.9 |
| 44496.1875 | 86.9 |
| 44496.197916666664 | 86.9 |
| 44496.208333333336 | 86.7 |
| 44496.21875 | 86.2 |
| 44496.229166666664 | 85.1 |
| 44496.239583333336 | 87.3 |
| 44496.25 | 88.7 |
| 44496.260416666664 | 88.9 |
| 44496.270833333336 | 87.2 |
| 44496.28125 | 86.3 |
| 44496.291666666664 | 87.4 |
| 44496.302083333336 | 85.8 |
| 44496.3125 | 86.6 |
| 44496.322916666664 | 85.3 |
| 44496.333333333336 | 85.7 |
| 44496.34375 | 84.5 |
| 44496.354166666664 | 83.7 |
| 44496.364583333336 | 83.6 |
| 44496.375 | 84.3 |
| 44496.385416666664 | 84.4 |
| 44496.395833333336 | 83.6 |
| 44496.40625 | 82.3 |
| 44496.416666666664 | 83.5 |
| 44496.427083333336 | 85.8 |
| 44496.4375 | 86.2 |
| 44496.447916666664 | 86.2 |
| 44496.458333333336 | 85.4 |
| 44496.46875 | 83.4 |
| 44496.479166666664 | 80.3 |
| 44496.489583333336 | 81.5 |
| 44496.5 | 82.7 |
| 44496.510416666664 | 83.5 |
| 44496.520833333336 | 83.6 |
| 44496.53125 | 84.3 |
| 44496.541666666664 | 84.8 |
| 44496.552083333336 | 84.9 |
| 44496.5625 | 85.3 |
| 44496.572916666664 | 85.5 |
| 44496.583333333336 | 86.1 |
| 44496.59375 | 86.5 |
| 44496.604166666664 | 87 |
| 44496.614583333336 | 87.3 |
| 44496.625 | 87.7 |
| 44496.635416666664 | 88.1 |
| 44496.645833333336 | 88.7 |
| 44496.65625 | 89.3 |
| 44496.666666666664 | 90.1 |
| 44496.677083333336 | 90.7 |
| 44496.6875 | 91.5 |
| 44496.697916666664 | 92 |
| 44496.708333333336 | 92.4 |
| 44496.71875 | 93.1 |
| 44496.729166666664 | 93.5 |
| 44496.739583333336 | 93.7 |
| 44496.75 | 94.2 |
| 44496.760416666664 | 94.1 |
| 44496.770833333336 | 93.6 |
| 44496.78125 | 93.4 |
| 44496.791666666664 | 94.9 |
| 44496.802083333336 | 94 |
| 44496.8125 | 94.7 |
| 44496.822916666664 | 94.7 |
| 44496.833333333336 | 95.5 |
| 44496.84375 | 95.7 |
| 44496.854166666664 | 95.9 |
| 44496.864583333336 | 95.4 |
| 44496.875 | 96.3 |
| 44496.885416666664 | 95.4 |
| 44496.895833333336 | 95.5 |
| 44496.90625 | 95.5 |
| 44496.916666666664 | 95.3 |
| 44496.927083333336 | 95 |
| 44496.9375 | 95.4 |
| 44496.947916666664 | 94.5 |
| 44496.958333333336 | 94 |
| 44496.96875 | 94.2 |
| 44496.979166666664 | 93.7 |
| 44496.989583333336 | 92.5 |
| 44497.0 | 92.2 |
| 44497.010416666664 | 91.6 |
| 44497.020833333336 | 93.4 |
| 44497.03125 | 92.3 |
| 44497.041666666664 | 92.3 |
| 44497.052083333336 | 91.4 |
| 44497.0625 | 90.2 |
| 44497.072916666664 | 87.6 |
| 44497.083333333336 | 89.6 |
| 44497.09375 | 89.5 |
| 44497.104166666664 | 89.5 |
| 44497.114583333336 | 90 |
| 44497.125 | 90.2 |
| 44497.135416666664 | 90.2 |
| 44497.145833333336 | 89.9 |
| 44497.15625 | 89.6 |
| 44497.166666666664 | 89.2 |
| 44497.177083333336 | 88.7 |
| 44497.1875 | 88.5 |
| 44497.197916666664 | 88.3 |
| 44497.208333333336 | 88.2 |
| 44497.21875 | 87.9 |
| 44497.229166666664 | 87.7 |
| 44497.239583333336 | 87.5 |
| 44497.25 | 84.6 |
| 44497.260416666664 | 85.7 |
| 44497.270833333336 | 83.3 |
| 44497.28125 | 84.3 |
| 44497.291666666664 | 82.4 |
| 44497.302083333336 | 81.9 |
| 44497.3125 | 80.9 |
| 44497.322916666664 | 79.2 |
| 44497.333333333336 | 78.8 |
| 44497.34375 | 81.1 |
| 44497.354166666664 | 77.8 |
| 44497.364583333336 | 78.4 |
| 44497.375 | 78.5 |
| 44497.385416666664 | 80.5 |
| 44497.395833333336 | 79.3 |
| 44497.40625 | 77.6 |
| 44497.416666666664 | 78 |
| 44497.427083333336 | 76.3 |
| 44497.4375 | 76.4 |
| 44497.447916666664 | 74.7 |
| 44497.458333333336 | 73.9 |
| 44497.46875 | 74.5 |
| 44497.479166666664 | 73.3 |
| 44497.489583333336 | 76 |
| 44497.5 | 75.3 |
| 44497.510416666664 | 75.3 |
| 44497.520833333336 | 78.6 |
| 44497.53125 | 75.8 |
| 44497.541666666664 | 74.8 |
| 44497.552083333336 | 76.2 |
| 44497.5625 | 76 |
| 44497.572916666664 | 77.2 |
| 44497.583333333336 | 77.6 |
| 44497.59375 | 78.3 |
| 44497.604166666664 | 78.6 |
| 44497.614583333336 | 78.8 |
| 44497.625 | 79.2 |
| 44497.635416666664 | 80.3 |
| 44497.645833333336 | 81.3 |
| 44497.65625 | 82.5 |
| 44497.666666666664 | 83.1 |
| 44497.677083333336 | 83.5 |
| 44497.6875 | 84.1 |
| 44497.697916666664 | 84.5 |
| 44497.708333333336 | 84.9 |
| 44497.71875 | 85.1 |
| 44497.729166666664 | 85.6 |
| 44497.739583333336 | 86 |
| 44497.75 | 86.7 |
| 44497.760416666664 | 87.1 |
| 44497.770833333336 | 87 |
| 44497.78125 | 87.4 |
| 44497.791666666664 | 84.5 |
| 44497.802083333336 | 86.9 |
| 44497.8125 | 87 |
| 44497.822916666664 | 89.9 |
| 44497.833333333336 | 90.2 |
| 44497.84375 | 90.5 |
| 44497.854166666664 | 92.7 |
| 44497.864583333336 | 92.2 |
| 44497.875 | 92.8 |
| 44497.885416666664 | 92.1 |
| 44497.895833333336 | 92.4 |
| 44497.90625 | 91.9 |
| 44497.916666666664 | 91 |
| 44497.927083333336 | 91.3 |
| 44497.9375 | 90.6 |
| 44497.947916666664 | 89 |
| 44497.958333333336 | 88.5 |
| 44497.96875 | 88.6 |
| 44497.979166666664 | 88 |
| 44497.989583333336 | 88 |
| 44498.0 | 88.2 |
| 44498.010416666664 | 87.7 |
| 44498.020833333336 | 87.7 |
| 44498.03125 | 88.1 |
| 44498.041666666664 | 86.4 |
| 44498.052083333336 | 89.7 |
| 44498.0625 | 90.7 |
| 44498.072916666664 | 89.3 |
| 44498.083333333336 | 90.9 |
| 44498.09375 | 91.5 |
| 44498.104166666664 | 91.2 |
| 44498.114583333336 | 91.4 |
| 44498.125 | 84.5 |
| 44498.135416666664 | 88 |
| 44498.145833333336 | 88.1 |
| 44498.15625 | 88.2 |
| 44498.166666666664 | 88.4 |
| 44498.177083333336 | 88.7 |
| 44498.1875 | 88.7 |
| 44498.197916666664 | 88.1 |
| 44498.208333333336 | 89.1 |
| 44498.21875 | 88.8 |
| 44498.229166666664 | 89 |
| 44498.239583333336 | 88.9 |
| 44498.25 | 88.9 |
| 44498.260416666664 | 89.4 |
| 44498.270833333336 | 89 |
| 44498.28125 | 83.7 |
| 44498.291666666664 | 74.3 |
| 44498.302083333336 | 80.6 |
| 44498.3125 | 81.4 |
| 44498.322916666664 | 81.4 |
| 44498.333333333336 | 85 |
| 44498.34375 | 82.2 |
| 44498.354166666664 | 84.6 |
| 44498.364583333336 | 82.9 |
| 44498.375 | 84.7 |
| 44498.385416666664 | 87 |
| 44498.395833333336 | 87.6 |
| 44498.40625 | 86.2 |
| 44498.416666666664 | 84.4 |
| 44498.427083333336 | 87.4 |
| 44498.4375 | 86.8 |
| 44498.447916666664 | 87.4 |
| 44498.458333333336 | 87.9 |
| 44498.46875 | 87.4 |
| 44498.479166666664 | 87.6 |
| 44498.489583333336 | 86.7 |
| 44498.5 | 86.8 |
| 44498.510416666664 | 87.9 |
| 44498.520833333336 | 87.3 |
| 44498.53125 | 88.3 |
| 44498.541666666664 | 89.1 |
| 44498.552083333336 | 89.5 |
| 44498.5625 | 89.7 |
| 44498.572916666664 | 89.5 |
| 44498.583333333336 | 89.8 |
| 44498.59375 | 90 |
| 44498.604166666664 | 89.3 |
| 44498.614583333336 | 89.6 |
| 44498.625 | 89.5 |
| 44498.635416666664 | 89.1 |
| 44498.645833333336 | 89.5 |
| 44498.65625 | 89.7 |
| 44498.666666666664 | 90.6 |
| 44498.677083333336 | 91.4 |
| 44498.6875 | 91.4 |
| 44498.697916666664 | 91.7 |
| 44498.708333333336 | 92.2 |
| 44498.71875 | 92.3 |
| 44498.729166666664 | 92.3 |
| 44498.739583333336 | 92.4 |
| 44498.75 | 92.6 |
| 44498.760416666664 | 92.5 |
| 44498.770833333336 | 92.4 |
| 44498.78125 | 92.5 |
| 44498.791666666664 | 94 |
| 44498.802083333336 | 93.8 |
| 44498.8125 | 93.9 |
| 44498.822916666664 | 93.4 |
| 44498.833333333336 | 93 |
| 44498.84375 | 93.4 |
| 44498.854166666664 | 93.3 |
| 44498.864583333336 | 92.8 |
| 44498.875 | 92.2 |
| 44498.885416666664 | 91.4 |
| 44498.895833333336 | 92.5 |
| 44498.90625 | 92.9 |
| 44498.916666666664 | 92.9 |
| 44498.927083333336 | 92.6 |
| 44498.9375 | 92.1 |
| 44498.947916666664 | 92.1 |
| 44498.958333333336 | 91.5 |
| 44498.96875 | 91.2 |
| 44498.979166666664 | 90.8 |
| 44498.989583333336 | 90 |
| 44499.0 | 90.2 |
| 44499.010416666664 | 89.8 |
| 44499.020833333336 | 89 |
| 44499.03125 | 87.8 |
| 44499.041666666664 | 86.5 |
| 44499.052083333336 | 86.3 |
| 44499.0625 | 86.9 |
| 44499.072916666664 | 85.7 |
| 44499.083333333336 | 85.7 |
| 44499.09375 | 85.4 |
| 44499.104166666664 | 85.9 |
| 44499.114583333336 | 86.3 |
| 44499.125 | 86.3 |
| 44499.135416666664 | 84.8 |
| 44499.145833333336 | 78.8 |
| 44499.15625 | 81.7 |
| 44499.166666666664 | 83 |
| 44499.177083333336 | 83.2 |
| 44499.1875 | 83.9 |
| 44499.197916666664 | 83.8 |
| 44499.208333333336 | 84.8 |
| 44499.21875 | 85.5 |
| 44499.229166666664 | 85.2 |
| 44499.239583333336 | 84.9 |
| 44499.25 | 84.9 |
| 44499.260416666664 | 84 |
| 44499.270833333336 | 84.3 |
| 44499.28125 | 85.5 |
| 44499.291666666664 | 85 |
| 44499.302083333336 | 84.6 |
| 44499.3125 | 83.3 |
| 44499.322916666664 | 85.6 |
| 44499.333333333336 | 84.7 |
| 44499.34375 | 86.1 |
| 44499.354166666664 | 85.3 |
| 44499.364583333336 | 85.5 |
| 44499.375 | 85.3 |
| 44499.385416666664 | 84.2 |
| 44499.395833333336 | 83.2 |
| 44499.40625 | 83.6 |
| 44499.416666666664 | 85.1 |
| 44499.427083333336 | 85.4 |
| 44499.4375 | 85.3 |
| 44499.447916666664 | 84.4 |
| 44499.458333333336 | 79.7 |
| 44499.46875 | 78.3 |
| 44499.479166666664 | 77.4 |
| 44499.489583333336 | 77.2 |
| 44499.5 | 74.8 |
| 44499.510416666664 | 73.5 |
| 44499.520833333336 | 73.2 |
| 44499.53125 | 72.3 |
| 44499.541666666664 | 73.7 |
| 44499.552083333336 | 77.1 |
| 44499.5625 | 79.2 |
| 44499.572916666664 | 79.9 |
| 44499.583333333336 | 80 |
| 44499.59375 | 80.2 |
| 44499.604166666664 | 80.3 |
| 44499.614583333336 | 78.4 |
| 44499.625 | 78.1 |
| 44499.635416666664 | 78.7 |
| 44499.645833333336 | 79.1 |
| 44499.65625 | 80.7 |
| 44499.666666666664 | 81.4 |
| 44499.677083333336 | 84 |
| 44499.6875 | 85.9 |
| 44499.697916666664 | 87.5 |
| 44499.708333333336 | 89.1 |
| 44499.71875 | 89.9 |
| 44499.729166666664 | 90.1 |
| 44499.739583333336 | 89.9 |
| 44499.75 | 90.1 |
| 44499.760416666664 | 90.7 |
| 44499.770833333336 | 91.6 |
| 44499.78125 | 92.4 |
| 44499.791666666664 | 93.8 |
| 44499.802083333336 | 94.9 |
| 44499.8125 | 95.6 |
| 44499.822916666664 | 96.1 |
| 44499.833333333336 | 96.4 |
| 44499.84375 | 97 |
| 44499.854166666664 | 95.9 |
| 44499.864583333336 | 94.9 |
| 44499.875 | 95.3 |
| 44499.885416666664 | 94.3 |
| 44499.895833333336 | 95.6 |
| 44499.90625 | 95.4 |
| 44499.916666666664 | 95.4 |
| 44499.927083333336 | 95.5 |
| 44499.9375 | 95.4 |
| 44499.947916666664 | 95.8 |
| 44499.958333333336 | 95 |
| 44499.96875 | 94.5 |
| 44499.979166666664 | 94.7 |
| 44499.989583333336 | 94.5 |
| 44500.0 | 92.6 |
| 44500.010416666664 | 93.3 |
| 44500.020833333336 | 92.3 |
| 44500.03125 | 91.5 |
| 44500.041666666664 | 90 |
| 44500.052083333336 | 90.2 |
| 44500.0625 | 87.6 |
| 44500.072916666664 | 87 |
| 44500.083333333336 | 86.8 |
| 44500.09375 | 87 |
| 44500.104166666664 | 87 |
| 44500.114583333336 | 89.1 |
| 44500.125 | 90.3 |
| 44500.135416666664 | 89.8 |
| 44500.145833333336 | 89.5 |
| 44500.15625 | 88.9 |
| 44500.166666666664 | 87.6 |
| 44500.177083333336 | 87.8 |
| 44500.1875 | 87.6 |
| 44500.197916666664 | 87.4 |
| 44500.208333333336 | 87.8 |
| 44500.21875 | 88 |
| 44500.229166666664 | 88.3 |
| 44500.239583333336 | 87.7 |
| 44500.25 | 87.1 |
| 44500.260416666664 | 87.1 |
| 44500.270833333336 | 87.3 |
| 44500.28125 | 87.3 |
| 44500.291666666664 | 87.4 |
| 44500.302083333336 | 87.3 |
| 44500.3125 | 87.1 |
| 44500.322916666664 | 87.1 |
| 44500.333333333336 | 87.1 |
| 44500.34375 | 86.9 |
| 44500.354166666664 | 86.6 |
| 44500.364583333336 | 86.6 |
| 44500.375 | 86.3 |
| 44500.385416666664 | 86.2 |
| 44500.395833333336 | 85.8 |
| 44500.40625 | 85 |
| 44500.416666666664 | 86 |
| 44500.427083333336 | 85.5 |
| 44500.4375 | 83.7 |
| 44500.447916666664 | 83.5 |
| 44500.458333333336 | 82.7 |
| 44500.46875 | 82.1 |
| 44500.479166666664 | 80.6 |
| 44500.489583333336 | 79.8 |
| 44500.5 | 77.5 |
| 44500.510416666664 | 75.8 |
| 44500.520833333336 | 75.7 |
| 44500.53125 | 74.5 |
| 44500.541666666664 | 74.4 |
| 44500.552083333336 | 74.3 |
| 44500.5625 | 74.7 |
| 44500.572916666664 | 75.6 |
| 44500.583333333336 | 77.9 |
| 44500.59375 | 78.6 |
| 44500.604166666664 | 79.3 |
| 44500.614583333336 | 81.4 |
| 44500.625 | 80.4 |
| 44500.635416666664 | 81.1 |
| 44500.645833333336 | 81.1 |
| 44500.65625 | 81.8 |
| 44500.666666666664 | 80.6 |
| 44500.677083333336 | 80.8 |
| 44500.6875 | 80.7 |
| 44500.697916666664 | 80.3 |
| 44500.708333333336 | 82 |
| 44500.71875 | 83.7 |
| 44500.729166666664 | 85.7 |
| 44500.739583333336 | 89.4 |
| 44500.75 | 94.1 |
| 44500.760416666664 | 95.7 |
| 44500.770833333336 | 96.4 |
| 44500.78125 | 96.8 |
| 44500.791666666664 | 97.4 |
| 44500.802083333336 | 97.9 |
| 44500.8125 | 98.4 |
| 44500.822916666664 | 98.6 |
| 44500.833333333336 | 98.7 |
| 44500.84375 | 99.2 |
| 44500.854166666664 | 99.7 |
| 44500.864583333336 | 100.2 |
| 44500.875 | 100.2 |
| 44500.885416666664 | 100.4 |
| 44500.895833333336 | 100.6 |
| 44500.90625 | 100.4 |
| 44500.916666666664 | 99.5 |
| 44500.927083333336 | 97.3 |
| 44500.9375 | 97.2 |
| 44500.947916666664 | 98.1 |
| 44500.958333333336 | 98 |
| 44500.96875 | 98 |
| 44500.979166666664 | 99 |
| 44500.989583333336 | 99.3 |
| 44501.0 | 99.8 |
| 44501.010416666664 | 97.4 |
| 44501.020833333336 | 96.4 |
| 44501.03125 | 95.4 |
| 44501.041666666664 | 93.2 |
| 44501.052083333336 | 90.9 |
| 44501.0625 | 89.7 |
| 44501.072916666664 | 88.1 |
| 44501.083333333336 | 87.6 |
| 44501.09375 | 87.8 |
| 44501.104166666664 | 88.4 |
| 44501.114583333336 | 89.9 |
| 44501.125 | 89.8 |
| 44501.135416666664 | 90.3 |
| 44501.145833333336 | 89.4 |
| 44501.15625 | 88.7 |